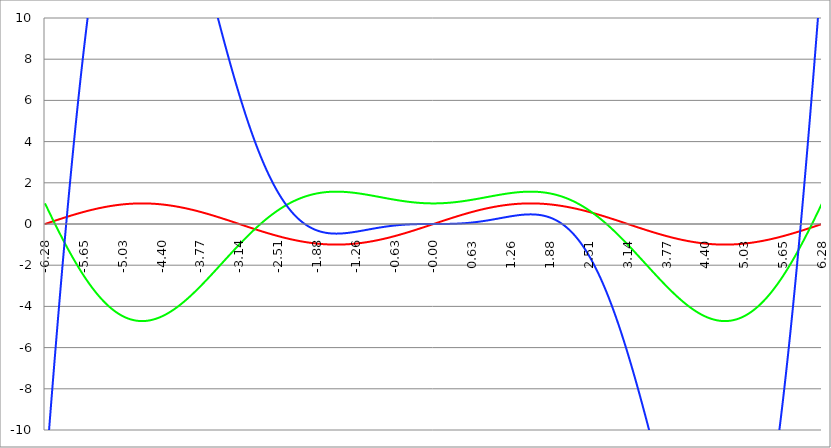
| Category | Series 1 | Series 0 | Series 2 |
|---|---|---|---|
| -6.283185307179586 | 0 | 1 | -12.566 |
| -6.276902121872407 | 0.006 | 0.961 | -12.319 |
| -6.270618936565228 | 0.013 | 0.921 | -12.071 |
| -6.264335751258049 | 0.019 | 0.882 | -11.824 |
| -6.25805256595087 | 0.025 | 0.842 | -11.578 |
| -6.25176938064369 | 0.031 | 0.803 | -11.333 |
| -6.245486195336511 | 0.038 | 0.764 | -11.087 |
| -6.23920301002933 | 0.044 | 0.725 | -10.843 |
| -6.232919824722153 | 0.05 | 0.686 | -10.599 |
| -6.226636639414973 | 0.057 | 0.646 | -10.355 |
| -6.220353454107794 | 0.063 | 0.607 | -10.112 |
| -6.214070268800615 | 0.069 | 0.568 | -9.87 |
| -6.207787083493435 | 0.075 | 0.53 | -9.628 |
| -6.201503898186257 | 0.082 | 0.491 | -9.387 |
| -6.195220712879077 | 0.088 | 0.452 | -9.146 |
| -6.188937527571898 | 0.094 | 0.413 | -8.907 |
| -6.182654342264719 | 0.1 | 0.374 | -8.667 |
| -6.17637115695754 | 0.107 | 0.336 | -8.429 |
| -6.170087971650361 | 0.113 | 0.297 | -8.191 |
| -6.163804786343182 | 0.119 | 0.259 | -7.953 |
| -6.157521601036002 | 0.125 | 0.22 | -7.717 |
| -6.151238415728823 | 0.132 | 0.182 | -7.481 |
| -6.144955230421644 | 0.138 | 0.144 | -7.245 |
| -6.138672045114464 | 0.144 | 0.106 | -7.011 |
| -6.132388859807286 | 0.15 | 0.067 | -6.777 |
| -6.126105674500106 | 0.156 | 0.029 | -6.543 |
| -6.119822489192927 | 0.163 | -0.009 | -6.311 |
| -6.113539303885748 | 0.169 | -0.047 | -6.079 |
| -6.107256118578569 | 0.175 | -0.084 | -5.848 |
| -6.10097293327139 | 0.181 | -0.122 | -5.618 |
| -6.09468974796421 | 0.187 | -0.16 | -5.388 |
| -6.088406562657031 | 0.194 | -0.197 | -5.159 |
| -6.082123377349852 | 0.2 | -0.235 | -4.931 |
| -6.075840192042672 | 0.206 | -0.272 | -4.704 |
| -6.069557006735494 | 0.212 | -0.31 | -4.477 |
| -6.063273821428314 | 0.218 | -0.347 | -4.251 |
| -6.056990636121135 | 0.224 | -0.384 | -4.026 |
| -6.050707450813956 | 0.23 | -0.421 | -3.802 |
| -6.044424265506777 | 0.236 | -0.458 | -3.578 |
| -6.038141080199597 | 0.243 | -0.495 | -3.356 |
| -6.031857894892418 | 0.249 | -0.531 | -3.134 |
| -6.025574709585239 | 0.255 | -0.568 | -2.913 |
| -6.01929152427806 | 0.261 | -0.605 | -2.693 |
| -6.013008338970881 | 0.267 | -0.641 | -2.473 |
| -6.006725153663701 | 0.273 | -0.678 | -2.255 |
| -6.000441968356522 | 0.279 | -0.714 | -2.037 |
| -5.994158783049343 | 0.285 | -0.75 | -1.82 |
| -5.987875597742164 | 0.291 | -0.786 | -1.604 |
| -5.981592412434984 | 0.297 | -0.822 | -1.389 |
| -5.975309227127805 | 0.303 | -0.858 | -1.175 |
| -5.969026041820626 | 0.309 | -0.893 | -0.962 |
| -5.962742856513447 | 0.315 | -0.929 | -0.749 |
| -5.956459671206268 | 0.321 | -0.965 | -0.538 |
| -5.950176485899088 | 0.327 | -1 | -0.327 |
| -5.94389330059191 | 0.333 | -1.035 | -0.117 |
| -5.93761011528473 | 0.339 | -1.07 | 0.092 |
| -5.931326929977551 | 0.345 | -1.105 | 0.3 |
| -5.925043744670372 | 0.351 | -1.14 | 0.507 |
| -5.918760559363193 | 0.356 | -1.175 | 0.713 |
| -5.912477374056014 | 0.362 | -1.21 | 0.918 |
| -5.906194188748834 | 0.368 | -1.244 | 1.122 |
| -5.899911003441655 | 0.374 | -1.279 | 1.326 |
| -5.893627818134476 | 0.38 | -1.313 | 1.528 |
| -5.887344632827297 | 0.386 | -1.347 | 1.729 |
| -5.881061447520117 | 0.391 | -1.381 | 1.93 |
| -5.874778262212938 | 0.397 | -1.415 | 2.129 |
| -5.868495076905759 | 0.403 | -1.449 | 2.328 |
| -5.86221189159858 | 0.409 | -1.483 | 2.525 |
| -5.855928706291401 | 0.414 | -1.516 | 2.722 |
| -5.849645520984221 | 0.42 | -1.55 | 2.918 |
| -5.843362335677042 | 0.426 | -1.583 | 3.112 |
| -5.837079150369863 | 0.431 | -1.616 | 3.306 |
| -5.830795965062684 | 0.437 | -1.649 | 3.498 |
| -5.824512779755505 | 0.443 | -1.682 | 3.69 |
| -5.818229594448325 | 0.448 | -1.715 | 3.881 |
| -5.811946409141146 | 0.454 | -1.748 | 4.07 |
| -5.805663223833967 | 0.46 | -1.78 | 4.259 |
| -5.799380038526788 | 0.465 | -1.812 | 4.446 |
| -5.793096853219609 | 0.471 | -1.845 | 4.633 |
| -5.78681366791243 | 0.476 | -1.877 | 4.819 |
| -5.780530482605251 | 0.482 | -1.908 | 5.003 |
| -5.774247297298071 | 0.487 | -1.94 | 5.186 |
| -5.767964111990892 | 0.493 | -1.972 | 5.369 |
| -5.761680926683713 | 0.498 | -2.003 | 5.55 |
| -5.755397741376534 | 0.504 | -2.035 | 5.731 |
| -5.749114556069355 | 0.509 | -2.066 | 5.91 |
| -5.742831370762175 | 0.514 | -2.097 | 6.088 |
| -5.736548185454996 | 0.52 | -2.128 | 6.265 |
| -5.730265000147816 | 0.525 | -2.158 | 6.441 |
| -5.723981814840638 | 0.531 | -2.189 | 6.616 |
| -5.717698629533459 | 0.536 | -2.219 | 6.79 |
| -5.711415444226279 | 0.541 | -2.25 | 6.963 |
| -5.7051322589191 | 0.546 | -2.28 | 7.135 |
| -5.698849073611921 | 0.552 | -2.31 | 7.306 |
| -5.692565888304742 | 0.557 | -2.339 | 7.476 |
| -5.686282702997562 | 0.562 | -2.369 | 7.644 |
| -5.679999517690383 | 0.567 | -2.399 | 7.812 |
| -5.673716332383204 | 0.572 | -2.428 | 7.978 |
| -5.667433147076025 | 0.578 | -2.457 | 8.143 |
| -5.661149961768846 | 0.583 | -2.486 | 8.307 |
| -5.654866776461667 | 0.588 | -2.515 | 8.471 |
| -5.648583591154487 | 0.593 | -2.543 | 8.633 |
| -5.642300405847308 | 0.598 | -2.572 | 8.793 |
| -5.63601722054013 | 0.603 | -2.6 | 8.953 |
| -5.62973403523295 | 0.608 | -2.628 | 9.112 |
| -5.623450849925771 | 0.613 | -2.656 | 9.269 |
| -5.617167664618591 | 0.618 | -2.684 | 9.426 |
| -5.610884479311412 | 0.623 | -2.712 | 9.581 |
| -5.604601294004233 | 0.628 | -2.739 | 9.735 |
| -5.598318108697054 | 0.633 | -2.767 | 9.889 |
| -5.592034923389875 | 0.637 | -2.794 | 10.04 |
| -5.585751738082695 | 0.642 | -2.821 | 10.191 |
| -5.579468552775516 | 0.647 | -2.848 | 10.341 |
| -5.573185367468337 | 0.652 | -2.874 | 10.49 |
| -5.566902182161157 | 0.657 | -2.901 | 10.637 |
| -5.560618996853979 | 0.661 | -2.927 | 10.783 |
| -5.5543358115468 | 0.666 | -2.953 | 10.928 |
| -5.54805262623962 | 0.671 | -2.979 | 11.072 |
| -5.54176944093244 | 0.675 | -3.005 | 11.215 |
| -5.535486255625262 | 0.68 | -3.031 | 11.357 |
| -5.529203070318083 | 0.685 | -3.056 | 11.498 |
| -5.522919885010904 | 0.689 | -3.081 | 11.637 |
| -5.516636699703724 | 0.694 | -3.106 | 11.775 |
| -5.510353514396545 | 0.698 | -3.131 | 11.913 |
| -5.504070329089366 | 0.703 | -3.156 | 12.049 |
| -5.497787143782186 | 0.707 | -3.18 | 12.184 |
| -5.491503958475008 | 0.712 | -3.205 | 12.317 |
| -5.485220773167828 | 0.716 | -3.229 | 12.45 |
| -5.47893758786065 | 0.72 | -3.253 | 12.581 |
| -5.47265440255347 | 0.725 | -3.277 | 12.711 |
| -5.466371217246291 | 0.729 | -3.3 | 12.841 |
| -5.460088031939112 | 0.733 | -3.324 | 12.968 |
| -5.453804846631932 | 0.738 | -3.347 | 13.095 |
| -5.447521661324753 | 0.742 | -3.37 | 13.221 |
| -5.441238476017574 | 0.746 | -3.393 | 13.345 |
| -5.434955290710395 | 0.75 | -3.416 | 13.469 |
| -5.428672105403215 | 0.754 | -3.438 | 13.591 |
| -5.422388920096036 | 0.758 | -3.46 | 13.712 |
| -5.416105734788857 | 0.762 | -3.482 | 13.832 |
| -5.409822549481678 | 0.766 | -3.504 | 13.95 |
| -5.403539364174499 | 0.771 | -3.526 | 14.068 |
| -5.39725617886732 | 0.775 | -3.548 | 14.184 |
| -5.39097299356014 | 0.778 | -3.569 | 14.299 |
| -5.384689808252961 | 0.782 | -3.59 | 14.414 |
| -5.378406622945782 | 0.786 | -3.611 | 14.526 |
| -5.372123437638603 | 0.79 | -3.632 | 14.638 |
| -5.365840252331424 | 0.794 | -3.652 | 14.749 |
| -5.359557067024244 | 0.798 | -3.673 | 14.858 |
| -5.353273881717065 | 0.802 | -3.693 | 14.966 |
| -5.346990696409886 | 0.805 | -3.713 | 15.073 |
| -5.340707511102707 | 0.809 | -3.733 | 15.179 |
| -5.334424325795528 | 0.813 | -3.753 | 15.284 |
| -5.328141140488348 | 0.816 | -3.772 | 15.388 |
| -5.32185795518117 | 0.82 | -3.791 | 15.49 |
| -5.31557476987399 | 0.824 | -3.81 | 15.591 |
| -5.30929158456681 | 0.827 | -3.829 | 15.692 |
| -5.303008399259631 | 0.831 | -3.848 | 15.791 |
| -5.296725213952453 | 0.834 | -3.866 | 15.888 |
| -5.290442028645273 | 0.838 | -3.884 | 15.985 |
| -5.284158843338094 | 0.841 | -3.903 | 16.081 |
| -5.277875658030915 | 0.844 | -3.92 | 16.175 |
| -5.271592472723735 | 0.848 | -3.938 | 16.268 |
| -5.265309287416557 | 0.851 | -3.956 | 16.36 |
| -5.259026102109377 | 0.854 | -3.973 | 16.451 |
| -5.252742916802198 | 0.858 | -3.99 | 16.541 |
| -5.246459731495019 | 0.861 | -4.007 | 16.629 |
| -5.24017654618784 | 0.864 | -4.023 | 16.717 |
| -5.23389336088066 | 0.867 | -4.04 | 16.803 |
| -5.227610175573481 | 0.87 | -4.056 | 16.888 |
| -5.221326990266302 | 0.873 | -4.072 | 16.972 |
| -5.215043804959122 | 0.876 | -4.088 | 17.055 |
| -5.208760619651944 | 0.879 | -4.104 | 17.137 |
| -5.202477434344764 | 0.882 | -4.119 | 17.218 |
| -5.196194249037585 | 0.885 | -4.135 | 17.297 |
| -5.189911063730406 | 0.888 | -4.15 | 17.375 |
| -5.183627878423227 | 0.891 | -4.165 | 17.453 |
| -5.177344693116048 | 0.894 | -4.179 | 17.529 |
| -5.171061507808868 | 0.897 | -4.194 | 17.604 |
| -5.164778322501689 | 0.899 | -4.208 | 17.678 |
| -5.15849513719451 | 0.902 | -4.222 | 17.75 |
| -5.152211951887331 | 0.905 | -4.236 | 17.822 |
| -5.145928766580152 | 0.907 | -4.25 | 17.892 |
| -5.139645581272972 | 0.91 | -4.263 | 17.962 |
| -5.133362395965793 | 0.913 | -4.277 | 18.03 |
| -5.127079210658614 | 0.915 | -4.29 | 18.097 |
| -5.120796025351435 | 0.918 | -4.302 | 18.163 |
| -5.114512840044256 | 0.92 | -4.315 | 18.228 |
| -5.108229654737076 | 0.923 | -4.328 | 18.292 |
| -5.101946469429897 | 0.925 | -4.34 | 18.354 |
| -5.095663284122718 | 0.927 | -4.352 | 18.416 |
| -5.08938009881554 | 0.93 | -4.364 | 18.476 |
| -5.08309691350836 | 0.932 | -4.376 | 18.536 |
| -5.07681372820118 | 0.934 | -4.387 | 18.594 |
| -5.070530542894002 | 0.937 | -4.398 | 18.651 |
| -5.064247357586822 | 0.939 | -4.409 | 18.707 |
| -5.057964172279643 | 0.941 | -4.42 | 18.762 |
| -5.051680986972464 | 0.943 | -4.431 | 18.816 |
| -5.045397801665285 | 0.945 | -4.441 | 18.869 |
| -5.039114616358106 | 0.947 | -4.452 | 18.921 |
| -5.032831431050926 | 0.949 | -4.462 | 18.971 |
| -5.026548245743747 | 0.951 | -4.472 | 19.021 |
| -5.020265060436568 | 0.953 | -4.481 | 19.069 |
| -5.013981875129389 | 0.955 | -4.491 | 19.117 |
| -5.00769868982221 | 0.957 | -4.5 | 19.163 |
| -5.00141550451503 | 0.959 | -4.509 | 19.209 |
| -4.995132319207851 | 0.96 | -4.518 | 19.253 |
| -4.98884913390067 | 0.962 | -4.526 | 19.296 |
| -4.982565948593493 | 0.964 | -4.535 | 19.338 |
| -4.976282763286313 | 0.965 | -4.543 | 19.379 |
| -4.969999577979134 | 0.967 | -4.551 | 19.419 |
| -4.963716392671955 | 0.969 | -4.559 | 19.458 |
| -4.957433207364776 | 0.97 | -4.567 | 19.496 |
| -4.951150022057597 | 0.972 | -4.574 | 19.533 |
| -4.944866836750418 | 0.973 | -4.581 | 19.569 |
| -4.938583651443238 | 0.975 | -4.589 | 19.604 |
| -4.932300466136059 | 0.976 | -4.595 | 19.638 |
| -4.92601728082888 | 0.977 | -4.602 | 19.671 |
| -4.9197340955217 | 0.979 | -4.608 | 19.703 |
| -4.913450910214521 | 0.98 | -4.615 | 19.733 |
| -4.907167724907342 | 0.981 | -4.621 | 19.763 |
| -4.900884539600163 | 0.982 | -4.627 | 19.792 |
| -4.894601354292984 | 0.983 | -4.632 | 19.82 |
| -4.888318168985805 | 0.985 | -4.638 | 19.847 |
| -4.882034983678625 | 0.986 | -4.643 | 19.872 |
| -4.875751798371446 | 0.987 | -4.648 | 19.897 |
| -4.869468613064267 | 0.988 | -4.653 | 19.921 |
| -4.863185427757088 | 0.989 | -4.658 | 19.944 |
| -4.856902242449909 | 0.99 | -4.662 | 19.966 |
| -4.85061905714273 | 0.99 | -4.667 | 19.986 |
| -4.84433587183555 | 0.991 | -4.671 | 20.006 |
| -4.838052686528371 | 0.992 | -4.675 | 20.025 |
| -4.831769501221192 | 0.993 | -4.678 | 20.043 |
| -4.825486315914013 | 0.994 | -4.682 | 20.06 |
| -4.819203130606833 | 0.994 | -4.685 | 20.076 |
| -4.812919945299654 | 0.995 | -4.688 | 20.091 |
| -4.806636759992475 | 0.996 | -4.691 | 20.105 |
| -4.800353574685296 | 0.996 | -4.694 | 20.119 |
| -4.794070389378117 | 0.997 | -4.696 | 20.131 |
| -4.787787204070938 | 0.997 | -4.699 | 20.142 |
| -4.781504018763758 | 0.998 | -4.701 | 20.153 |
| -4.77522083345658 | 0.998 | -4.703 | 20.162 |
| -4.7689376481494 | 0.998 | -4.705 | 20.171 |
| -4.762654462842221 | 0.999 | -4.706 | 20.178 |
| -4.756371277535042 | 0.999 | -4.708 | 20.185 |
| -4.750088092227862 | 0.999 | -4.709 | 20.191 |
| -4.743804906920683 | 1 | -4.71 | 20.196 |
| -4.737521721613504 | 1 | -4.711 | 20.2 |
| -4.731238536306324 | 1 | -4.712 | 20.203 |
| -4.724955350999146 | 1 | -4.712 | 20.205 |
| -4.718672165691966 | 1 | -4.712 | 20.206 |
| -4.712388980384787 | 1 | -4.712 | 20.207 |
| -4.706105795077608 | 1 | -4.712 | 20.206 |
| -4.699822609770429 | 1 | -4.712 | 20.205 |
| -4.69353942446325 | 1 | -4.712 | 20.203 |
| -4.68725623915607 | 1 | -4.711 | 20.2 |
| -4.680973053848891 | 1 | -4.71 | 20.196 |
| -4.674689868541712 | 0.999 | -4.709 | 20.191 |
| -4.668406683234533 | 0.999 | -4.708 | 20.185 |
| -4.662123497927354 | 0.999 | -4.706 | 20.179 |
| -4.655840312620174 | 0.998 | -4.705 | 20.172 |
| -4.649557127312995 | 0.998 | -4.703 | 20.164 |
| -4.643273942005816 | 0.998 | -4.701 | 20.155 |
| -4.636990756698637 | 0.997 | -4.699 | 20.145 |
| -4.630707571391458 | 0.997 | -4.697 | 20.134 |
| -4.624424386084279 | 0.996 | -4.694 | 20.123 |
| -4.618141200777099 | 0.996 | -4.692 | 20.111 |
| -4.61185801546992 | 0.995 | -4.689 | 20.098 |
| -4.605574830162741 | 0.994 | -4.686 | 20.084 |
| -4.599291644855561 | 0.994 | -4.683 | 20.069 |
| -4.593008459548383 | 0.993 | -4.679 | 20.054 |
| -4.586725274241203 | 0.992 | -4.676 | 20.038 |
| -4.580442088934024 | 0.991 | -4.672 | 20.021 |
| -4.574158903626845 | 0.99 | -4.668 | 20.003 |
| -4.567875718319666 | 0.99 | -4.664 | 19.984 |
| -4.561592533012487 | 0.989 | -4.66 | 19.965 |
| -4.555309347705307 | 0.988 | -4.656 | 19.945 |
| -4.549026162398128 | 0.987 | -4.651 | 19.924 |
| -4.542742977090949 | 0.986 | -4.646 | 19.903 |
| -4.53645979178377 | 0.985 | -4.641 | 19.881 |
| -4.530176606476591 | 0.983 | -4.636 | 19.858 |
| -4.523893421169412 | 0.982 | -4.631 | 19.834 |
| -4.517610235862232 | 0.981 | -4.626 | 19.809 |
| -4.511327050555053 | 0.98 | -4.62 | 19.784 |
| -4.505043865247874 | 0.979 | -4.614 | 19.758 |
| -4.498760679940694 | 0.977 | -4.609 | 19.732 |
| -4.492477494633515 | 0.976 | -4.602 | 19.704 |
| -4.486194309326336 | 0.975 | -4.596 | 19.676 |
| -4.479911124019157 | 0.973 | -4.59 | 19.648 |
| -4.473627938711977 | 0.972 | -4.583 | 19.618 |
| -4.467344753404799 | 0.97 | -4.576 | 19.588 |
| -4.46106156809762 | 0.969 | -4.57 | 19.558 |
| -4.45477838279044 | 0.967 | -4.563 | 19.526 |
| -4.44849519748326 | 0.965 | -4.555 | 19.494 |
| -4.442212012176082 | 0.964 | -4.548 | 19.461 |
| -4.435928826868903 | 0.962 | -4.54 | 19.428 |
| -4.429645641561723 | 0.96 | -4.533 | 19.394 |
| -4.423362456254544 | 0.959 | -4.525 | 19.359 |
| -4.417079270947365 | 0.957 | -4.517 | 19.324 |
| -4.410796085640185 | 0.955 | -4.509 | 19.288 |
| -4.404512900333007 | 0.953 | -4.5 | 19.251 |
| -4.398229715025827 | 0.951 | -4.492 | 19.214 |
| -4.391946529718648 | 0.949 | -4.483 | 19.176 |
| -4.38566334441147 | 0.947 | -4.475 | 19.137 |
| -4.37938015910429 | 0.945 | -4.466 | 19.098 |
| -4.373096973797111 | 0.943 | -4.457 | 19.059 |
| -4.366813788489932 | 0.941 | -4.447 | 19.018 |
| -4.360530603182752 | 0.939 | -4.438 | 18.977 |
| -4.354247417875573 | 0.937 | -4.429 | 18.936 |
| -4.347964232568394 | 0.934 | -4.419 | 18.894 |
| -4.341681047261215 | 0.932 | -4.409 | 18.851 |
| -4.335397861954035 | 0.93 | -4.399 | 18.808 |
| -4.329114676646856 | 0.927 | -4.389 | 18.764 |
| -4.322831491339677 | 0.925 | -4.379 | 18.72 |
| -4.316548306032498 | 0.923 | -4.368 | 18.675 |
| -4.310265120725319 | 0.92 | -4.358 | 18.63 |
| -4.30398193541814 | 0.918 | -4.347 | 18.584 |
| -4.29769875011096 | 0.915 | -4.336 | 18.537 |
| -4.291415564803781 | 0.913 | -4.325 | 18.49 |
| -4.285132379496602 | 0.91 | -4.314 | 18.443 |
| -4.278849194189422 | 0.907 | -4.303 | 18.395 |
| -4.272566008882244 | 0.905 | -4.292 | 18.346 |
| -4.266282823575064 | 0.902 | -4.28 | 18.297 |
| -4.259999638267885 | 0.899 | -4.269 | 18.247 |
| -4.253716452960706 | 0.897 | -4.257 | 18.197 |
| -4.247433267653527 | 0.894 | -4.245 | 18.147 |
| -4.241150082346347 | 0.891 | -4.233 | 18.096 |
| -4.234866897039168 | 0.888 | -4.221 | 18.044 |
| -4.228583711731989 | 0.885 | -4.208 | 17.992 |
| -4.22230052642481 | 0.882 | -4.196 | 17.94 |
| -4.216017341117631 | 0.879 | -4.183 | 17.887 |
| -4.209734155810452 | 0.876 | -4.171 | 17.833 |
| -4.203450970503273 | 0.873 | -4.158 | 17.779 |
| -4.197167785196093 | 0.87 | -4.145 | 17.725 |
| -4.190884599888914 | 0.867 | -4.132 | 17.67 |
| -4.184601414581734 | 0.864 | -4.119 | 17.615 |
| -4.178318229274556 | 0.861 | -4.105 | 17.56 |
| -4.172035043967377 | 0.858 | -4.092 | 17.503 |
| -4.165751858660197 | 0.854 | -4.079 | 17.447 |
| -4.159468673353018 | 0.851 | -4.065 | 17.39 |
| -4.153185488045839 | 0.848 | -4.051 | 17.333 |
| -4.14690230273866 | 0.844 | -4.037 | 17.275 |
| -4.140619117431481 | 0.841 | -4.023 | 17.217 |
| -4.134335932124301 | 0.838 | -4.009 | 17.159 |
| -4.128052746817122 | 0.834 | -3.995 | 17.1 |
| -4.121769561509943 | 0.831 | -3.98 | 17.04 |
| -4.115486376202764 | 0.827 | -3.966 | 16.981 |
| -4.109203190895584 | 0.824 | -3.951 | 16.921 |
| -4.102920005588405 | 0.82 | -3.937 | 16.86 |
| -4.096636820281226 | 0.816 | -3.922 | 16.8 |
| -4.090353634974047 | 0.813 | -3.907 | 16.739 |
| -4.084070449666868 | 0.809 | -3.892 | 16.677 |
| -4.077787264359689 | 0.805 | -3.877 | 16.615 |
| -4.071504079052509 | 0.802 | -3.861 | 16.553 |
| -4.06522089374533 | 0.798 | -3.846 | 16.491 |
| -4.058937708438151 | 0.794 | -3.831 | 16.428 |
| -4.052654523130972 | 0.79 | -3.815 | 16.365 |
| -4.046371337823793 | 0.786 | -3.799 | 16.302 |
| -4.040088152516613 | 0.782 | -3.784 | 16.238 |
| -4.033804967209434 | 0.778 | -3.768 | 16.174 |
| -4.027521781902255 | 0.775 | -3.752 | 16.11 |
| -4.021238596595076 | 0.771 | -3.736 | 16.045 |
| -4.014955411287897 | 0.766 | -3.72 | 15.98 |
| -4.008672225980717 | 0.762 | -3.703 | 15.915 |
| -4.002389040673538 | 0.758 | -3.687 | 15.849 |
| -3.996105855366359 | 0.754 | -3.671 | 15.784 |
| -3.989822670059179 | 0.75 | -3.654 | 15.718 |
| -3.983539484752 | 0.746 | -3.637 | 15.651 |
| -3.97725629944482 | 0.742 | -3.621 | 15.585 |
| -3.97097311413764 | 0.738 | -3.604 | 15.518 |
| -3.96468992883046 | 0.733 | -3.587 | 15.451 |
| -3.958406743523281 | 0.729 | -3.57 | 15.384 |
| -3.952123558216101 | 0.725 | -3.553 | 15.316 |
| -3.945840372908922 | 0.72 | -3.536 | 15.248 |
| -3.939557187601742 | 0.716 | -3.519 | 15.18 |
| -3.933274002294562 | 0.712 | -3.501 | 15.112 |
| -3.926990816987382 | 0.707 | -3.484 | 15.044 |
| -3.920707631680203 | 0.703 | -3.466 | 14.975 |
| -3.914424446373023 | 0.698 | -3.449 | 14.906 |
| -3.908141261065844 | 0.694 | -3.431 | 14.837 |
| -3.901858075758664 | 0.689 | -3.413 | 14.768 |
| -3.895574890451484 | 0.685 | -3.396 | 14.699 |
| -3.889291705144305 | 0.68 | -3.378 | 14.629 |
| -3.883008519837125 | 0.675 | -3.36 | 14.559 |
| -3.876725334529945 | 0.671 | -3.342 | 14.489 |
| -3.870442149222766 | 0.666 | -3.324 | 14.419 |
| -3.864158963915586 | 0.661 | -3.306 | 14.349 |
| -3.857875778608407 | 0.657 | -3.287 | 14.279 |
| -3.851592593301227 | 0.652 | -3.269 | 14.208 |
| -3.845309407994047 | 0.647 | -3.251 | 14.137 |
| -3.839026222686868 | 0.642 | -3.232 | 14.066 |
| -3.832743037379688 | 0.637 | -3.214 | 13.995 |
| -3.826459852072508 | 0.633 | -3.195 | 13.924 |
| -3.820176666765329 | 0.628 | -3.176 | 13.853 |
| -3.813893481458149 | 0.623 | -3.158 | 13.781 |
| -3.807610296150969 | 0.618 | -3.139 | 13.71 |
| -3.80132711084379 | 0.613 | -3.12 | 13.638 |
| -3.79504392553661 | 0.608 | -3.101 | 13.566 |
| -3.78876074022943 | 0.603 | -3.082 | 13.494 |
| -3.782477554922251 | 0.598 | -3.063 | 13.422 |
| -3.776194369615071 | 0.593 | -3.044 | 13.35 |
| -3.769911184307892 | 0.588 | -3.025 | 13.278 |
| -3.763627999000712 | 0.583 | -3.006 | 13.206 |
| -3.757344813693532 | 0.578 | -2.986 | 13.133 |
| -3.751061628386352 | 0.572 | -2.967 | 13.061 |
| -3.744778443079173 | 0.567 | -2.948 | 12.988 |
| -3.738495257771993 | 0.562 | -2.928 | 12.916 |
| -3.732212072464814 | 0.557 | -2.909 | 12.843 |
| -3.725928887157634 | 0.552 | -2.889 | 12.77 |
| -3.719645701850454 | 0.546 | -2.87 | 12.698 |
| -3.713362516543275 | 0.541 | -2.85 | 12.625 |
| -3.707079331236095 | 0.536 | -2.831 | 12.552 |
| -3.700796145928915 | 0.531 | -2.811 | 12.479 |
| -3.694512960621736 | 0.525 | -2.791 | 12.406 |
| -3.688229775314556 | 0.52 | -2.771 | 12.333 |
| -3.681946590007376 | 0.514 | -2.752 | 12.26 |
| -3.675663404700197 | 0.509 | -2.732 | 12.187 |
| -3.669380219393017 | 0.504 | -2.712 | 12.114 |
| -3.663097034085838 | 0.498 | -2.692 | 12.041 |
| -3.656813848778658 | 0.493 | -2.672 | 11.968 |
| -3.650530663471478 | 0.487 | -2.652 | 11.895 |
| -3.644247478164299 | 0.482 | -2.632 | 11.821 |
| -3.63796429285712 | 0.476 | -2.612 | 11.748 |
| -3.631681107549939 | 0.471 | -2.592 | 11.675 |
| -3.62539792224276 | 0.465 | -2.572 | 11.602 |
| -3.61911473693558 | 0.46 | -2.551 | 11.529 |
| -3.612831551628401 | 0.454 | -2.531 | 11.456 |
| -3.606548366321221 | 0.448 | -2.511 | 11.383 |
| -3.600265181014041 | 0.443 | -2.491 | 11.31 |
| -3.593981995706862 | 0.437 | -2.47 | 11.237 |
| -3.587698810399682 | 0.431 | -2.45 | 11.164 |
| -3.581415625092502 | 0.426 | -2.43 | 11.091 |
| -3.575132439785323 | 0.42 | -2.409 | 11.018 |
| -3.568849254478143 | 0.414 | -2.389 | 10.945 |
| -3.562566069170964 | 0.409 | -2.369 | 10.872 |
| -3.556282883863784 | 0.403 | -2.348 | 10.8 |
| -3.549999698556604 | 0.397 | -2.328 | 10.727 |
| -3.543716513249425 | 0.391 | -2.307 | 10.654 |
| -3.537433327942245 | 0.386 | -2.287 | 10.582 |
| -3.531150142635065 | 0.38 | -2.266 | 10.509 |
| -3.524866957327886 | 0.374 | -2.246 | 10.437 |
| -3.518583772020706 | 0.368 | -2.225 | 10.364 |
| -3.512300586713526 | 0.362 | -2.204 | 10.292 |
| -3.506017401406347 | 0.356 | -2.184 | 10.22 |
| -3.499734216099167 | 0.351 | -2.163 | 10.148 |
| -3.493451030791987 | 0.345 | -2.143 | 10.076 |
| -3.487167845484808 | 0.339 | -2.122 | 10.004 |
| -3.480884660177628 | 0.333 | -2.101 | 9.932 |
| -3.474601474870449 | 0.327 | -2.081 | 9.86 |
| -3.468318289563269 | 0.321 | -2.06 | 9.788 |
| -3.462035104256089 | 0.315 | -2.04 | 9.717 |
| -3.45575191894891 | 0.309 | -2.019 | 9.646 |
| -3.44946873364173 | 0.303 | -1.998 | 9.574 |
| -3.44318554833455 | 0.297 | -1.978 | 9.503 |
| -3.436902363027371 | 0.291 | -1.957 | 9.432 |
| -3.430619177720191 | 0.285 | -1.936 | 9.361 |
| -3.424335992413011 | 0.279 | -1.916 | 9.29 |
| -3.418052807105832 | 0.273 | -1.895 | 9.22 |
| -3.411769621798652 | 0.267 | -1.874 | 9.149 |
| -3.405486436491473 | 0.261 | -1.854 | 9.079 |
| -3.399203251184293 | 0.255 | -1.833 | 9.008 |
| -3.392920065877113 | 0.249 | -1.812 | 8.938 |
| -3.386636880569934 | 0.243 | -1.792 | 8.868 |
| -3.380353695262754 | 0.236 | -1.771 | 8.798 |
| -3.374070509955574 | 0.23 | -1.75 | 8.729 |
| -3.367787324648395 | 0.224 | -1.73 | 8.659 |
| -3.361504139341215 | 0.218 | -1.709 | 8.59 |
| -3.355220954034035 | 0.212 | -1.689 | 8.521 |
| -3.348937768726855 | 0.206 | -1.668 | 8.452 |
| -3.342654583419676 | 0.2 | -1.647 | 8.383 |
| -3.336371398112496 | 0.194 | -1.627 | 8.314 |
| -3.330088212805317 | 0.187 | -1.606 | 8.245 |
| -3.323805027498137 | 0.181 | -1.586 | 8.177 |
| -3.317521842190957 | 0.175 | -1.565 | 8.109 |
| -3.311238656883778 | 0.169 | -1.545 | 8.041 |
| -3.304955471576598 | 0.163 | -1.524 | 7.973 |
| -3.298672286269419 | 0.156 | -1.504 | 7.905 |
| -3.292389100962239 | 0.15 | -1.483 | 7.838 |
| -3.286105915655059 | 0.144 | -1.463 | 7.771 |
| -3.27982273034788 | 0.138 | -1.442 | 7.704 |
| -3.2735395450407 | 0.132 | -1.422 | 7.637 |
| -3.26725635973352 | 0.125 | -1.402 | 7.57 |
| -3.260973174426341 | 0.119 | -1.381 | 7.504 |
| -3.254689989119161 | 0.113 | -1.361 | 7.438 |
| -3.248406803811982 | 0.107 | -1.341 | 7.372 |
| -3.242123618504802 | 0.1 | -1.32 | 7.306 |
| -3.235840433197622 | 0.094 | -1.3 | 7.24 |
| -3.229557247890442 | 0.088 | -1.28 | 7.175 |
| -3.223274062583263 | 0.082 | -1.26 | 7.11 |
| -3.216990877276083 | 0.075 | -1.239 | 7.045 |
| -3.210707691968904 | 0.069 | -1.219 | 6.98 |
| -3.204424506661724 | 0.063 | -1.199 | 6.915 |
| -3.198141321354544 | 0.057 | -1.179 | 6.851 |
| -3.191858136047365 | 0.05 | -1.159 | 6.787 |
| -3.185574950740185 | 0.044 | -1.139 | 6.723 |
| -3.179291765433005 | 0.038 | -1.119 | 6.66 |
| -3.173008580125826 | 0.031 | -1.099 | 6.596 |
| -3.166725394818646 | 0.025 | -1.079 | 6.533 |
| -3.160442209511467 | 0.019 | -1.059 | 6.47 |
| -3.154159024204287 | 0.013 | -1.04 | 6.408 |
| -3.147875838897107 | 0.006 | -1.02 | 6.345 |
| -3.141592653589928 | 0 | -1 | 6.283 |
| -3.135309468282748 | -0.006 | -0.98 | 6.221 |
| -3.129026282975568 | -0.013 | -0.961 | 6.16 |
| -3.122743097668389 | -0.019 | -0.941 | 6.098 |
| -3.116459912361209 | -0.025 | -0.921 | 6.037 |
| -3.110176727054029 | -0.031 | -0.902 | 5.976 |
| -3.10389354174685 | -0.038 | -0.882 | 5.916 |
| -3.09761035643967 | -0.044 | -0.863 | 5.855 |
| -3.09132717113249 | -0.05 | -0.843 | 5.795 |
| -3.085043985825311 | -0.057 | -0.824 | 5.735 |
| -3.078760800518131 | -0.063 | -0.805 | 5.676 |
| -3.072477615210952 | -0.069 | -0.785 | 5.616 |
| -3.066194429903772 | -0.075 | -0.766 | 5.557 |
| -3.059911244596592 | -0.082 | -0.747 | 5.499 |
| -3.053628059289413 | -0.088 | -0.728 | 5.44 |
| -3.047344873982233 | -0.094 | -0.709 | 5.382 |
| -3.041061688675053 | -0.1 | -0.69 | 5.324 |
| -3.034778503367874 | -0.107 | -0.671 | 5.266 |
| -3.028495318060694 | -0.113 | -0.652 | 5.209 |
| -3.022212132753515 | -0.119 | -0.633 | 5.152 |
| -3.015928947446335 | -0.125 | -0.614 | 5.095 |
| -3.009645762139155 | -0.132 | -0.595 | 5.038 |
| -3.003362576831975 | -0.138 | -0.577 | 4.982 |
| -2.997079391524796 | -0.144 | -0.558 | 4.926 |
| -2.990796206217616 | -0.15 | -0.539 | 4.87 |
| -2.984513020910436 | -0.156 | -0.521 | 4.815 |
| -2.978229835603257 | -0.163 | -0.502 | 4.76 |
| -2.971946650296077 | -0.169 | -0.484 | 4.705 |
| -2.965663464988898 | -0.175 | -0.466 | 4.65 |
| -2.959380279681718 | -0.181 | -0.447 | 4.596 |
| -2.953097094374538 | -0.187 | -0.429 | 4.542 |
| -2.946813909067359 | -0.194 | -0.411 | 4.489 |
| -2.94053072376018 | -0.2 | -0.393 | 4.435 |
| -2.934247538453 | -0.206 | -0.375 | 4.382 |
| -2.92796435314582 | -0.212 | -0.357 | 4.329 |
| -2.92168116783864 | -0.218 | -0.339 | 4.277 |
| -2.915397982531461 | -0.224 | -0.321 | 4.225 |
| -2.909114797224281 | -0.23 | -0.303 | 4.173 |
| -2.902831611917101 | -0.236 | -0.285 | 4.121 |
| -2.896548426609922 | -0.243 | -0.267 | 4.07 |
| -2.890265241302742 | -0.249 | -0.25 | 4.019 |
| -2.883982055995562 | -0.255 | -0.232 | 3.968 |
| -2.877698870688383 | -0.261 | -0.215 | 3.918 |
| -2.871415685381203 | -0.267 | -0.197 | 3.868 |
| -2.865132500074023 | -0.273 | -0.18 | 3.818 |
| -2.858849314766844 | -0.279 | -0.163 | 3.768 |
| -2.852566129459664 | -0.285 | -0.145 | 3.719 |
| -2.846282944152485 | -0.291 | -0.128 | 3.67 |
| -2.839999758845305 | -0.297 | -0.111 | 3.622 |
| -2.833716573538125 | -0.303 | -0.094 | 3.574 |
| -2.827433388230946 | -0.309 | -0.077 | 3.526 |
| -2.821150202923766 | -0.315 | -0.06 | 3.478 |
| -2.814867017616586 | -0.321 | -0.044 | 3.431 |
| -2.808583832309407 | -0.327 | -0.027 | 3.384 |
| -2.802300647002227 | -0.333 | -0.01 | 3.337 |
| -2.796017461695047 | -0.339 | 0.006 | 3.291 |
| -2.789734276387867 | -0.345 | 0.023 | 3.245 |
| -2.783451091080688 | -0.351 | 0.039 | 3.199 |
| -2.777167905773509 | -0.356 | 0.055 | 3.154 |
| -2.770884720466329 | -0.362 | 0.072 | 3.108 |
| -2.764601535159149 | -0.368 | 0.088 | 3.064 |
| -2.75831834985197 | -0.374 | 0.104 | 3.019 |
| -2.75203516454479 | -0.38 | 0.12 | 2.975 |
| -2.74575197923761 | -0.386 | 0.136 | 2.931 |
| -2.739468793930431 | -0.391 | 0.152 | 2.888 |
| -2.733185608623251 | -0.397 | 0.168 | 2.844 |
| -2.726902423316071 | -0.403 | 0.183 | 2.801 |
| -2.720619238008892 | -0.409 | 0.199 | 2.759 |
| -2.714336052701712 | -0.414 | 0.215 | 2.716 |
| -2.708052867394532 | -0.42 | 0.23 | 2.674 |
| -2.701769682087352 | -0.426 | 0.246 | 2.633 |
| -2.695486496780173 | -0.431 | 0.261 | 2.591 |
| -2.689203311472993 | -0.437 | 0.276 | 2.55 |
| -2.682920126165814 | -0.443 | 0.291 | 2.51 |
| -2.676636940858634 | -0.448 | 0.306 | 2.469 |
| -2.670353755551454 | -0.454 | 0.321 | 2.429 |
| -2.664070570244275 | -0.46 | 0.336 | 2.39 |
| -2.657787384937095 | -0.465 | 0.351 | 2.35 |
| -2.651504199629916 | -0.471 | 0.366 | 2.311 |
| -2.645221014322736 | -0.476 | 0.38 | 2.272 |
| -2.638937829015556 | -0.482 | 0.395 | 2.234 |
| -2.632654643708377 | -0.487 | 0.409 | 2.195 |
| -2.626371458401197 | -0.493 | 0.424 | 2.158 |
| -2.620088273094018 | -0.498 | 0.438 | 2.12 |
| -2.613805087786838 | -0.504 | 0.452 | 2.083 |
| -2.607521902479658 | -0.509 | 0.467 | 2.046 |
| -2.601238717172478 | -0.514 | 0.481 | 2.009 |
| -2.594955531865299 | -0.52 | 0.495 | 1.973 |
| -2.588672346558119 | -0.525 | 0.509 | 1.937 |
| -2.58238916125094 | -0.531 | 0.522 | 1.901 |
| -2.57610597594376 | -0.536 | 0.536 | 1.866 |
| -2.56982279063658 | -0.541 | 0.55 | 1.831 |
| -2.563539605329401 | -0.546 | 0.563 | 1.796 |
| -2.557256420022221 | -0.552 | 0.577 | 1.762 |
| -2.550973234715042 | -0.557 | 0.59 | 1.728 |
| -2.544690049407862 | -0.562 | 0.603 | 1.694 |
| -2.538406864100682 | -0.567 | 0.616 | 1.66 |
| -2.532123678793503 | -0.572 | 0.63 | 1.627 |
| -2.525840493486323 | -0.578 | 0.643 | 1.594 |
| -2.519557308179143 | -0.583 | 0.655 | 1.562 |
| -2.513274122871964 | -0.588 | 0.668 | 1.529 |
| -2.506990937564784 | -0.593 | 0.681 | 1.497 |
| -2.500707752257604 | -0.598 | 0.694 | 1.466 |
| -2.494424566950425 | -0.603 | 0.706 | 1.434 |
| -2.488141381643245 | -0.608 | 0.719 | 1.403 |
| -2.481858196336065 | -0.613 | 0.731 | 1.373 |
| -2.475575011028886 | -0.618 | 0.743 | 1.342 |
| -2.469291825721706 | -0.623 | 0.755 | 1.312 |
| -2.463008640414527 | -0.628 | 0.768 | 1.282 |
| -2.456725455107347 | -0.633 | 0.78 | 1.253 |
| -2.450442269800167 | -0.637 | 0.791 | 1.224 |
| -2.444159084492988 | -0.642 | 0.803 | 1.195 |
| -2.437875899185808 | -0.647 | 0.815 | 1.166 |
| -2.431592713878628 | -0.652 | 0.827 | 1.138 |
| -2.425309528571449 | -0.657 | 0.838 | 1.11 |
| -2.419026343264269 | -0.661 | 0.85 | 1.082 |
| -2.412743157957089 | -0.666 | 0.861 | 1.054 |
| -2.40645997264991 | -0.671 | 0.872 | 1.027 |
| -2.40017678734273 | -0.675 | 0.883 | 1 |
| -2.393893602035551 | -0.68 | 0.894 | 0.974 |
| -2.387610416728371 | -0.685 | 0.905 | 0.948 |
| -2.381327231421191 | -0.689 | 0.916 | 0.922 |
| -2.375044046114012 | -0.694 | 0.927 | 0.896 |
| -2.368760860806832 | -0.698 | 0.938 | 0.871 |
| -2.362477675499652 | -0.703 | 0.948 | 0.846 |
| -2.356194490192473 | -0.707 | 0.959 | 0.821 |
| -2.349911304885293 | -0.712 | 0.969 | 0.796 |
| -2.343628119578113 | -0.716 | 0.98 | 0.772 |
| -2.337344934270934 | -0.72 | 0.99 | 0.748 |
| -2.331061748963754 | -0.725 | 1 | 0.724 |
| -2.324778563656574 | -0.729 | 1.01 | 0.701 |
| -2.318495378349395 | -0.733 | 1.02 | 0.678 |
| -2.312212193042215 | -0.738 | 1.03 | 0.655 |
| -2.305929007735036 | -0.742 | 1.04 | 0.633 |
| -2.299645822427856 | -0.746 | 1.049 | 0.61 |
| -2.293362637120676 | -0.75 | 1.059 | 0.588 |
| -2.287079451813496 | -0.754 | 1.068 | 0.567 |
| -2.280796266506317 | -0.758 | 1.078 | 0.545 |
| -2.274513081199137 | -0.762 | 1.087 | 0.524 |
| -2.268229895891957 | -0.766 | 1.096 | 0.503 |
| -2.261946710584778 | -0.771 | 1.105 | 0.482 |
| -2.255663525277598 | -0.775 | 1.114 | 0.462 |
| -2.249380339970419 | -0.778 | 1.123 | 0.442 |
| -2.24309715466324 | -0.782 | 1.132 | 0.422 |
| -2.23681396935606 | -0.786 | 1.141 | 0.403 |
| -2.23053078404888 | -0.79 | 1.15 | 0.383 |
| -2.2242475987417 | -0.794 | 1.158 | 0.364 |
| -2.217964413434521 | -0.798 | 1.167 | 0.345 |
| -2.211681228127341 | -0.802 | 1.175 | 0.327 |
| -2.205398042820161 | -0.805 | 1.183 | 0.309 |
| -2.199114857512981 | -0.809 | 1.191 | 0.291 |
| -2.192831672205802 | -0.813 | 1.199 | 0.273 |
| -2.186548486898622 | -0.816 | 1.207 | 0.256 |
| -2.180265301591443 | -0.82 | 1.215 | 0.238 |
| -2.173982116284263 | -0.824 | 1.223 | 0.221 |
| -2.167698930977084 | -0.827 | 1.231 | 0.205 |
| -2.161415745669904 | -0.831 | 1.238 | 0.188 |
| -2.155132560362724 | -0.834 | 1.246 | 0.172 |
| -2.148849375055545 | -0.838 | 1.253 | 0.156 |
| -2.142566189748365 | -0.841 | 1.261 | 0.14 |
| -2.136283004441185 | -0.844 | 1.268 | 0.125 |
| -2.129999819134006 | -0.848 | 1.275 | 0.11 |
| -2.123716633826826 | -0.851 | 1.282 | 0.095 |
| -2.117433448519646 | -0.854 | 1.289 | 0.08 |
| -2.111150263212467 | -0.858 | 1.296 | 0.065 |
| -2.104867077905287 | -0.861 | 1.303 | 0.051 |
| -2.098583892598107 | -0.864 | 1.309 | 0.037 |
| -2.092300707290928 | -0.867 | 1.316 | 0.023 |
| -2.086017521983748 | -0.87 | 1.322 | 0.009 |
| -2.079734336676569 | -0.873 | 1.329 | -0.004 |
| -2.073451151369389 | -0.876 | 1.335 | -0.017 |
| -2.06716796606221 | -0.879 | 1.341 | -0.03 |
| -2.06088478075503 | -0.882 | 1.348 | -0.043 |
| -2.05460159544785 | -0.885 | 1.354 | -0.055 |
| -2.04831841014067 | -0.888 | 1.36 | -0.067 |
| -2.042035224833491 | -0.891 | 1.365 | -0.079 |
| -2.035752039526311 | -0.894 | 1.371 | -0.091 |
| -2.029468854219131 | -0.897 | 1.377 | -0.103 |
| -2.023185668911951 | -0.899 | 1.383 | -0.114 |
| -2.016902483604772 | -0.902 | 1.388 | -0.125 |
| -2.010619298297592 | -0.905 | 1.393 | -0.136 |
| -2.004336112990412 | -0.907 | 1.399 | -0.147 |
| -1.998052927683233 | -0.91 | 1.404 | -0.157 |
| -1.991769742376054 | -0.913 | 1.409 | -0.168 |
| -1.985486557068874 | -0.915 | 1.414 | -0.178 |
| -1.979203371761694 | -0.918 | 1.419 | -0.187 |
| -1.972920186454515 | -0.92 | 1.424 | -0.197 |
| -1.966637001147335 | -0.923 | 1.429 | -0.207 |
| -1.960353815840155 | -0.925 | 1.434 | -0.216 |
| -1.954070630532976 | -0.927 | 1.438 | -0.225 |
| -1.947787445225796 | -0.93 | 1.443 | -0.234 |
| -1.941504259918616 | -0.932 | 1.447 | -0.243 |
| -1.935221074611437 | -0.934 | 1.452 | -0.251 |
| -1.928937889304257 | -0.937 | 1.456 | -0.259 |
| -1.922654703997078 | -0.939 | 1.46 | -0.267 |
| -1.916371518689898 | -0.941 | 1.464 | -0.275 |
| -1.910088333382718 | -0.943 | 1.468 | -0.283 |
| -1.903805148075539 | -0.945 | 1.472 | -0.291 |
| -1.897521962768359 | -0.947 | 1.476 | -0.298 |
| -1.891238777461179 | -0.949 | 1.48 | -0.305 |
| -1.884955592154 | -0.951 | 1.484 | -0.312 |
| -1.87867240684682 | -0.953 | 1.487 | -0.319 |
| -1.87238922153964 | -0.955 | 1.491 | -0.326 |
| -1.866106036232461 | -0.957 | 1.494 | -0.332 |
| -1.859822850925281 | -0.959 | 1.498 | -0.338 |
| -1.853539665618102 | -0.96 | 1.501 | -0.344 |
| -1.847256480310922 | -0.962 | 1.504 | -0.35 |
| -1.840973295003742 | -0.964 | 1.507 | -0.356 |
| -1.834690109696563 | -0.965 | 1.51 | -0.362 |
| -1.828406924389383 | -0.967 | 1.513 | -0.367 |
| -1.822123739082203 | -0.969 | 1.516 | -0.372 |
| -1.815840553775024 | -0.97 | 1.519 | -0.377 |
| -1.809557368467844 | -0.972 | 1.522 | -0.382 |
| -1.803274183160664 | -0.973 | 1.524 | -0.387 |
| -1.796990997853485 | -0.975 | 1.527 | -0.392 |
| -1.790707812546305 | -0.976 | 1.529 | -0.396 |
| -1.784424627239125 | -0.977 | 1.532 | -0.401 |
| -1.778141441931946 | -0.979 | 1.534 | -0.405 |
| -1.771858256624766 | -0.98 | 1.536 | -0.409 |
| -1.765575071317587 | -0.981 | 1.539 | -0.413 |
| -1.759291886010407 | -0.982 | 1.541 | -0.416 |
| -1.753008700703227 | -0.983 | 1.543 | -0.42 |
| -1.746725515396048 | -0.985 | 1.545 | -0.423 |
| -1.740442330088868 | -0.986 | 1.547 | -0.427 |
| -1.734159144781688 | -0.987 | 1.548 | -0.43 |
| -1.727875959474509 | -0.988 | 1.55 | -0.433 |
| -1.72159277416733 | -0.989 | 1.552 | -0.436 |
| -1.715309588860149 | -0.99 | 1.553 | -0.438 |
| -1.70902640355297 | -0.99 | 1.555 | -0.441 |
| -1.70274321824579 | -0.991 | 1.556 | -0.443 |
| -1.69646003293861 | -0.992 | 1.558 | -0.446 |
| -1.690176847631431 | -0.993 | 1.559 | -0.448 |
| -1.683893662324251 | -0.994 | 1.56 | -0.45 |
| -1.677610477017072 | -0.994 | 1.561 | -0.452 |
| -1.671327291709892 | -0.995 | 1.563 | -0.454 |
| -1.665044106402712 | -0.996 | 1.564 | -0.456 |
| -1.658760921095533 | -0.996 | 1.564 | -0.457 |
| -1.652477735788353 | -0.997 | 1.565 | -0.459 |
| -1.646194550481173 | -0.997 | 1.566 | -0.46 |
| -1.639911365173994 | -0.998 | 1.567 | -0.461 |
| -1.633628179866814 | -0.998 | 1.568 | -0.462 |
| -1.627344994559634 | -0.998 | 1.568 | -0.463 |
| -1.621061809252455 | -0.999 | 1.569 | -0.464 |
| -1.614778623945275 | -0.999 | 1.569 | -0.465 |
| -1.608495438638096 | -0.999 | 1.57 | -0.466 |
| -1.602212253330916 | -1 | 1.57 | -0.466 |
| -1.595929068023736 | -1 | 1.57 | -0.467 |
| -1.589645882716557 | -1 | 1.571 | -0.467 |
| -1.583362697409377 | -1 | 1.571 | -0.467 |
| -1.577079512102197 | -1 | 1.571 | -0.467 |
| -1.570796326795018 | -1 | 1.571 | -0.467 |
| -1.564513141487838 | -1 | 1.571 | -0.467 |
| -1.558229956180659 | -1 | 1.571 | -0.467 |
| -1.551946770873479 | -1 | 1.571 | -0.467 |
| -1.545663585566299 | -1 | 1.57 | -0.467 |
| -1.53938040025912 | -1 | 1.57 | -0.466 |
| -1.53309721495194 | -0.999 | 1.57 | -0.466 |
| -1.52681402964476 | -0.999 | 1.569 | -0.465 |
| -1.520530844337581 | -0.999 | 1.569 | -0.464 |
| -1.514247659030401 | -0.998 | 1.568 | -0.464 |
| -1.507964473723221 | -0.998 | 1.568 | -0.463 |
| -1.501681288416042 | -0.998 | 1.567 | -0.462 |
| -1.495398103108862 | -0.997 | 1.566 | -0.461 |
| -1.489114917801682 | -0.997 | 1.566 | -0.46 |
| -1.482831732494503 | -0.996 | 1.565 | -0.459 |
| -1.476548547187323 | -0.996 | 1.564 | -0.457 |
| -1.470265361880144 | -0.995 | 1.563 | -0.456 |
| -1.463982176572964 | -0.994 | 1.562 | -0.455 |
| -1.457698991265784 | -0.994 | 1.561 | -0.453 |
| -1.451415805958605 | -0.993 | 1.56 | -0.452 |
| -1.445132620651425 | -0.992 | 1.559 | -0.45 |
| -1.438849435344245 | -0.991 | 1.558 | -0.448 |
| -1.432566250037066 | -0.99 | 1.557 | -0.447 |
| -1.426283064729886 | -0.99 | 1.555 | -0.445 |
| -1.419999879422706 | -0.989 | 1.554 | -0.443 |
| -1.413716694115527 | -0.988 | 1.553 | -0.441 |
| -1.407433508808347 | -0.987 | 1.551 | -0.439 |
| -1.401150323501168 | -0.986 | 1.55 | -0.437 |
| -1.394867138193988 | -0.985 | 1.548 | -0.435 |
| -1.388583952886808 | -0.983 | 1.547 | -0.433 |
| -1.382300767579629 | -0.982 | 1.545 | -0.43 |
| -1.376017582272449 | -0.981 | 1.544 | -0.428 |
| -1.369734396965269 | -0.98 | 1.542 | -0.426 |
| -1.36345121165809 | -0.979 | 1.54 | -0.423 |
| -1.35716802635091 | -0.977 | 1.538 | -0.421 |
| -1.35088484104373 | -0.976 | 1.536 | -0.418 |
| -1.344601655736551 | -0.975 | 1.535 | -0.416 |
| -1.338318470429371 | -0.973 | 1.533 | -0.413 |
| -1.332035285122191 | -0.972 | 1.531 | -0.411 |
| -1.325752099815012 | -0.97 | 1.529 | -0.408 |
| -1.319468914507832 | -0.969 | 1.527 | -0.405 |
| -1.313185729200653 | -0.967 | 1.525 | -0.403 |
| -1.306902543893473 | -0.965 | 1.523 | -0.4 |
| -1.300619358586293 | -0.964 | 1.52 | -0.397 |
| -1.294336173279114 | -0.962 | 1.518 | -0.394 |
| -1.288052987971934 | -0.96 | 1.516 | -0.391 |
| -1.281769802664754 | -0.959 | 1.514 | -0.388 |
| -1.275486617357575 | -0.957 | 1.511 | -0.385 |
| -1.269203432050395 | -0.955 | 1.509 | -0.382 |
| -1.262920246743215 | -0.953 | 1.507 | -0.379 |
| -1.256637061436036 | -0.951 | 1.504 | -0.376 |
| -1.250353876128856 | -0.949 | 1.502 | -0.373 |
| -1.244070690821677 | -0.947 | 1.499 | -0.37 |
| -1.237787505514497 | -0.945 | 1.497 | -0.367 |
| -1.231504320207317 | -0.943 | 1.494 | -0.364 |
| -1.225221134900138 | -0.941 | 1.492 | -0.361 |
| -1.218937949592958 | -0.939 | 1.489 | -0.358 |
| -1.212654764285778 | -0.937 | 1.486 | -0.354 |
| -1.206371578978599 | -0.934 | 1.484 | -0.351 |
| -1.20008839367142 | -0.932 | 1.481 | -0.348 |
| -1.193805208364239 | -0.93 | 1.478 | -0.344 |
| -1.18752202305706 | -0.927 | 1.475 | -0.341 |
| -1.18123883774988 | -0.925 | 1.473 | -0.338 |
| -1.1749556524427 | -0.923 | 1.47 | -0.335 |
| -1.168672467135521 | -0.92 | 1.467 | -0.331 |
| -1.162389281828341 | -0.918 | 1.464 | -0.328 |
| -1.156106096521162 | -0.915 | 1.461 | -0.324 |
| -1.149822911213982 | -0.913 | 1.458 | -0.321 |
| -1.143539725906802 | -0.91 | 1.455 | -0.318 |
| -1.137256540599623 | -0.907 | 1.452 | -0.314 |
| -1.130973355292443 | -0.905 | 1.449 | -0.311 |
| -1.124690169985263 | -0.902 | 1.446 | -0.307 |
| -1.118406984678084 | -0.899 | 1.443 | -0.304 |
| -1.112123799370904 | -0.897 | 1.44 | -0.301 |
| -1.105840614063724 | -0.894 | 1.437 | -0.297 |
| -1.099557428756545 | -0.891 | 1.434 | -0.294 |
| -1.093274243449365 | -0.888 | 1.431 | -0.29 |
| -1.086991058142186 | -0.885 | 1.427 | -0.287 |
| -1.080707872835006 | -0.882 | 1.424 | -0.283 |
| -1.074424687527826 | -0.879 | 1.421 | -0.28 |
| -1.068141502220647 | -0.876 | 1.418 | -0.276 |
| -1.061858316913467 | -0.873 | 1.415 | -0.273 |
| -1.055575131606287 | -0.87 | 1.411 | -0.269 |
| -1.049291946299108 | -0.867 | 1.408 | -0.266 |
| -1.043008760991928 | -0.864 | 1.405 | -0.263 |
| -1.036725575684748 | -0.861 | 1.401 | -0.259 |
| -1.030442390377569 | -0.858 | 1.398 | -0.256 |
| -1.024159205070389 | -0.854 | 1.395 | -0.252 |
| -1.01787601976321 | -0.851 | 1.391 | -0.249 |
| -1.01159283445603 | -0.848 | 1.388 | -0.245 |
| -1.00530964914885 | -0.844 | 1.385 | -0.242 |
| -0.999026463841671 | -0.841 | 1.381 | -0.239 |
| -0.992743278534491 | -0.838 | 1.378 | -0.235 |
| -0.986460093227311 | -0.834 | 1.374 | -0.232 |
| -0.980176907920132 | -0.831 | 1.371 | -0.228 |
| -0.973893722612952 | -0.827 | 1.368 | -0.225 |
| -0.967610537305772 | -0.824 | 1.364 | -0.222 |
| -0.961327351998593 | -0.82 | 1.361 | -0.218 |
| -0.955044166691413 | -0.816 | 1.357 | -0.215 |
| -0.948760981384233 | -0.813 | 1.354 | -0.212 |
| -0.942477796077054 | -0.809 | 1.35 | -0.209 |
| -0.936194610769874 | -0.805 | 1.347 | -0.205 |
| -0.929911425462695 | -0.802 | 1.343 | -0.202 |
| -0.923628240155515 | -0.798 | 1.34 | -0.199 |
| -0.917345054848335 | -0.794 | 1.336 | -0.196 |
| -0.911061869541156 | -0.79 | 1.333 | -0.192 |
| -0.904778684233976 | -0.786 | 1.329 | -0.189 |
| -0.898495498926796 | -0.782 | 1.326 | -0.186 |
| -0.892212313619617 | -0.778 | 1.322 | -0.183 |
| -0.885929128312437 | -0.775 | 1.319 | -0.18 |
| -0.879645943005257 | -0.771 | 1.315 | -0.177 |
| -0.873362757698078 | -0.766 | 1.312 | -0.174 |
| -0.867079572390898 | -0.762 | 1.308 | -0.17 |
| -0.860796387083718 | -0.758 | 1.305 | -0.167 |
| -0.854513201776539 | -0.754 | 1.301 | -0.164 |
| -0.848230016469359 | -0.75 | 1.298 | -0.161 |
| -0.84194683116218 | -0.746 | 1.294 | -0.158 |
| -0.835663645855 | -0.742 | 1.291 | -0.155 |
| -0.82938046054782 | -0.738 | 1.287 | -0.153 |
| -0.823097275240641 | -0.733 | 1.283 | -0.15 |
| -0.816814089933461 | -0.729 | 1.28 | -0.147 |
| -0.810530904626281 | -0.725 | 1.276 | -0.144 |
| -0.804247719319102 | -0.72 | 1.273 | -0.141 |
| -0.797964534011922 | -0.716 | 1.269 | -0.138 |
| -0.791681348704742 | -0.712 | 1.266 | -0.135 |
| -0.785398163397563 | -0.707 | 1.262 | -0.133 |
| -0.779114978090383 | -0.703 | 1.259 | -0.13 |
| -0.772831792783204 | -0.698 | 1.256 | -0.127 |
| -0.766548607476024 | -0.694 | 1.252 | -0.125 |
| -0.760265422168844 | -0.689 | 1.249 | -0.122 |
| -0.753982236861665 | -0.685 | 1.245 | -0.119 |
| -0.747699051554485 | -0.68 | 1.242 | -0.117 |
| -0.741415866247305 | -0.675 | 1.238 | -0.114 |
| -0.735132680940126 | -0.671 | 1.235 | -0.112 |
| -0.728849495632946 | -0.666 | 1.231 | -0.109 |
| -0.722566310325766 | -0.661 | 1.228 | -0.107 |
| -0.716283125018587 | -0.657 | 1.225 | -0.104 |
| -0.709999939711407 | -0.652 | 1.221 | -0.102 |
| -0.703716754404227 | -0.647 | 1.218 | -0.099 |
| -0.697433569097048 | -0.642 | 1.214 | -0.097 |
| -0.691150383789868 | -0.637 | 1.211 | -0.095 |
| -0.684867198482689 | -0.633 | 1.208 | -0.092 |
| -0.678584013175509 | -0.628 | 1.204 | -0.09 |
| -0.672300827868329 | -0.623 | 1.201 | -0.088 |
| -0.66601764256115 | -0.618 | 1.198 | -0.086 |
| -0.65973445725397 | -0.613 | 1.195 | -0.084 |
| -0.65345127194679 | -0.608 | 1.191 | -0.081 |
| -0.647168086639611 | -0.603 | 1.188 | -0.079 |
| -0.640884901332431 | -0.598 | 1.185 | -0.077 |
| -0.634601716025251 | -0.593 | 1.182 | -0.075 |
| -0.628318530718072 | -0.588 | 1.178 | -0.073 |
| -0.622035345410892 | -0.583 | 1.175 | -0.071 |
| -0.615752160103712 | -0.578 | 1.172 | -0.069 |
| -0.609468974796533 | -0.572 | 1.169 | -0.067 |
| -0.603185789489353 | -0.567 | 1.166 | -0.065 |
| -0.596902604182174 | -0.562 | 1.163 | -0.063 |
| -0.590619418874994 | -0.557 | 1.159 | -0.062 |
| -0.584336233567814 | -0.552 | 1.156 | -0.06 |
| -0.578053048260635 | -0.546 | 1.153 | -0.058 |
| -0.571769862953455 | -0.541 | 1.15 | -0.056 |
| -0.565486677646275 | -0.536 | 1.147 | -0.055 |
| -0.559203492339096 | -0.531 | 1.144 | -0.053 |
| -0.552920307031916 | -0.525 | 1.141 | -0.051 |
| -0.546637121724737 | -0.52 | 1.138 | -0.05 |
| -0.540353936417557 | -0.514 | 1.136 | -0.048 |
| -0.534070751110377 | -0.509 | 1.133 | -0.047 |
| -0.527787565803198 | -0.504 | 1.13 | -0.045 |
| -0.521504380496018 | -0.498 | 1.127 | -0.043 |
| -0.515221195188838 | -0.493 | 1.124 | -0.042 |
| -0.508938009881659 | -0.487 | 1.121 | -0.041 |
| -0.502654824574479 | -0.482 | 1.118 | -0.039 |
| -0.496371639267299 | -0.476 | 1.116 | -0.038 |
| -0.49008845396012 | -0.471 | 1.113 | -0.036 |
| -0.48380526865294 | -0.465 | 1.11 | -0.035 |
| -0.477522083345761 | -0.46 | 1.108 | -0.034 |
| -0.471238898038581 | -0.454 | 1.105 | -0.033 |
| -0.464955712731402 | -0.448 | 1.102 | -0.031 |
| -0.458672527424222 | -0.443 | 1.1 | -0.03 |
| -0.452389342117042 | -0.437 | 1.097 | -0.029 |
| -0.446106156809863 | -0.431 | 1.095 | -0.028 |
| -0.439822971502683 | -0.426 | 1.092 | -0.027 |
| -0.433539786195504 | -0.42 | 1.09 | -0.026 |
| -0.427256600888324 | -0.414 | 1.087 | -0.025 |
| -0.420973415581144 | -0.409 | 1.085 | -0.024 |
| -0.414690230273965 | -0.403 | 1.082 | -0.023 |
| -0.408407044966785 | -0.397 | 1.08 | -0.022 |
| -0.402123859659606 | -0.391 | 1.078 | -0.021 |
| -0.395840674352426 | -0.386 | 1.075 | -0.02 |
| -0.389557489045247 | -0.38 | 1.073 | -0.019 |
| -0.383274303738067 | -0.374 | 1.071 | -0.018 |
| -0.376991118430887 | -0.368 | 1.069 | -0.017 |
| -0.370707933123708 | -0.362 | 1.066 | -0.016 |
| -0.364424747816528 | -0.356 | 1.064 | -0.015 |
| -0.358141562509349 | -0.351 | 1.062 | -0.015 |
| -0.351858377202169 | -0.345 | 1.06 | -0.014 |
| -0.345575191894989 | -0.339 | 1.058 | -0.013 |
| -0.33929200658781 | -0.333 | 1.056 | -0.013 |
| -0.33300882128063 | -0.327 | 1.054 | -0.012 |
| -0.326725635973451 | -0.321 | 1.052 | -0.011 |
| -0.320442450666271 | -0.315 | 1.05 | -0.011 |
| -0.314159265359092 | -0.309 | 1.048 | -0.01 |
| -0.307876080051912 | -0.303 | 1.046 | -0.009 |
| -0.301592894744732 | -0.297 | 1.044 | -0.009 |
| -0.295309709437553 | -0.291 | 1.043 | -0.008 |
| -0.289026524130373 | -0.285 | 1.041 | -0.008 |
| -0.282743338823194 | -0.279 | 1.039 | -0.007 |
| -0.276460153516014 | -0.273 | 1.037 | -0.007 |
| -0.270176968208834 | -0.267 | 1.036 | -0.006 |
| -0.263893782901655 | -0.261 | 1.034 | -0.006 |
| -0.257610597594475 | -0.255 | 1.033 | -0.006 |
| -0.251327412287296 | -0.249 | 1.031 | -0.005 |
| -0.245044226980116 | -0.243 | 1.03 | -0.005 |
| -0.238761041672937 | -0.236 | 1.028 | -0.004 |
| -0.232477856365757 | -0.23 | 1.027 | -0.004 |
| -0.226194671058577 | -0.224 | 1.025 | -0.004 |
| -0.219911485751398 | -0.218 | 1.024 | -0.003 |
| -0.213628300444218 | -0.212 | 1.023 | -0.003 |
| -0.207345115137039 | -0.206 | 1.021 | -0.003 |
| -0.201061929829859 | -0.2 | 1.02 | -0.003 |
| -0.194778744522679 | -0.194 | 1.019 | -0.002 |
| -0.1884955592155 | -0.187 | 1.018 | -0.002 |
| -0.18221237390832 | -0.181 | 1.016 | -0.002 |
| -0.175929188601141 | -0.175 | 1.015 | -0.002 |
| -0.169646003293961 | -0.169 | 1.014 | -0.002 |
| -0.163362817986782 | -0.163 | 1.013 | -0.001 |
| -0.157079632679602 | -0.156 | 1.012 | -0.001 |
| -0.150796447372422 | -0.15 | 1.011 | -0.001 |
| -0.144513262065243 | -0.144 | 1.01 | -0.001 |
| -0.138230076758063 | -0.138 | 1.01 | -0.001 |
| -0.131946891450884 | -0.132 | 1.009 | -0.001 |
| -0.125663706143704 | -0.125 | 1.008 | -0.001 |
| -0.119380520836524 | -0.119 | 1.007 | -0.001 |
| -0.113097335529345 | -0.113 | 1.006 | 0 |
| -0.106814150222165 | -0.107 | 1.006 | 0 |
| -0.100530964914986 | -0.1 | 1.005 | 0 |
| -0.0942477796078061 | -0.094 | 1.004 | 0 |
| -0.0879645943006265 | -0.088 | 1.004 | 0 |
| -0.0816814089934469 | -0.082 | 1.003 | 0 |
| -0.0753982236862674 | -0.075 | 1.003 | 0 |
| -0.0691150383790878 | -0.069 | 1.002 | 0 |
| -0.0628318530719082 | -0.063 | 1.002 | 0 |
| -0.0565486677647286 | -0.057 | 1.002 | 0 |
| -0.050265482457549 | -0.05 | 1.001 | 0 |
| -0.0439822971503694 | -0.044 | 1.001 | 0 |
| -0.0376991118431899 | -0.038 | 1.001 | 0 |
| -0.0314159265360103 | -0.031 | 1 | 0 |
| -0.0251327412288307 | -0.025 | 1 | 0 |
| -0.0188495559216511 | -0.019 | 1 | 0 |
| -0.0125663706144715 | -0.013 | 1 | 0 |
| -0.00628318530729192 | -0.006 | 1 | 0 |
| -1.12338957580782e-13 | 0 | 1 | 0 |
| 0.00628318530706725 | 0.006 | 1 | 0 |
| 0.0125663706142468 | 0.013 | 1 | 0 |
| 0.0188495559214264 | 0.019 | 1 | 0 |
| 0.025132741228606 | 0.025 | 1 | 0 |
| 0.0314159265357856 | 0.031 | 1 | 0 |
| 0.0376991118429652 | 0.038 | 1.001 | 0 |
| 0.0439822971501448 | 0.044 | 1.001 | 0 |
| 0.0502654824573243 | 0.05 | 1.001 | 0 |
| 0.0565486677645039 | 0.057 | 1.002 | 0 |
| 0.0628318530716835 | 0.063 | 1.002 | 0 |
| 0.0691150383788631 | 0.069 | 1.002 | 0 |
| 0.0753982236860427 | 0.075 | 1.003 | 0 |
| 0.0816814089932222 | 0.082 | 1.003 | 0 |
| 0.0879645943004018 | 0.088 | 1.004 | 0 |
| 0.0942477796075814 | 0.094 | 1.004 | 0 |
| 0.100530964914761 | 0.1 | 1.005 | 0 |
| 0.106814150221941 | 0.107 | 1.006 | 0 |
| 0.11309733552912 | 0.113 | 1.006 | 0 |
| 0.1193805208363 | 0.119 | 1.007 | 0.001 |
| 0.125663706143479 | 0.125 | 1.008 | 0.001 |
| 0.131946891450659 | 0.132 | 1.009 | 0.001 |
| 0.138230076757839 | 0.138 | 1.01 | 0.001 |
| 0.144513262065018 | 0.144 | 1.01 | 0.001 |
| 0.150796447372198 | 0.15 | 1.011 | 0.001 |
| 0.157079632679377 | 0.156 | 1.012 | 0.001 |
| 0.163362817986557 | 0.163 | 1.013 | 0.001 |
| 0.169646003293736 | 0.169 | 1.014 | 0.002 |
| 0.175929188600916 | 0.175 | 1.015 | 0.002 |
| 0.182212373908096 | 0.181 | 1.016 | 0.002 |
| 0.188495559215275 | 0.187 | 1.018 | 0.002 |
| 0.194778744522455 | 0.194 | 1.019 | 0.002 |
| 0.201061929829634 | 0.2 | 1.02 | 0.003 |
| 0.207345115136814 | 0.206 | 1.021 | 0.003 |
| 0.213628300443994 | 0.212 | 1.023 | 0.003 |
| 0.219911485751173 | 0.218 | 1.024 | 0.003 |
| 0.226194671058353 | 0.224 | 1.025 | 0.004 |
| 0.232477856365532 | 0.23 | 1.027 | 0.004 |
| 0.238761041672712 | 0.236 | 1.028 | 0.004 |
| 0.245044226979891 | 0.243 | 1.03 | 0.005 |
| 0.251327412287071 | 0.249 | 1.031 | 0.005 |
| 0.257610597594251 | 0.255 | 1.033 | 0.006 |
| 0.26389378290143 | 0.261 | 1.034 | 0.006 |
| 0.27017696820861 | 0.267 | 1.036 | 0.006 |
| 0.276460153515789 | 0.273 | 1.037 | 0.007 |
| 0.282743338822969 | 0.279 | 1.039 | 0.007 |
| 0.289026524130149 | 0.285 | 1.041 | 0.008 |
| 0.295309709437328 | 0.291 | 1.043 | 0.008 |
| 0.301592894744508 | 0.297 | 1.044 | 0.009 |
| 0.307876080051687 | 0.303 | 1.046 | 0.009 |
| 0.314159265358867 | 0.309 | 1.048 | 0.01 |
| 0.320442450666046 | 0.315 | 1.05 | 0.011 |
| 0.326725635973226 | 0.321 | 1.052 | 0.011 |
| 0.333008821280406 | 0.327 | 1.054 | 0.012 |
| 0.339292006587585 | 0.333 | 1.056 | 0.013 |
| 0.345575191894765 | 0.339 | 1.058 | 0.013 |
| 0.351858377201944 | 0.345 | 1.06 | 0.014 |
| 0.358141562509124 | 0.351 | 1.062 | 0.015 |
| 0.364424747816304 | 0.356 | 1.064 | 0.015 |
| 0.370707933123483 | 0.362 | 1.066 | 0.016 |
| 0.376991118430663 | 0.368 | 1.069 | 0.017 |
| 0.383274303737842 | 0.374 | 1.071 | 0.018 |
| 0.389557489045022 | 0.38 | 1.073 | 0.019 |
| 0.395840674352201 | 0.386 | 1.075 | 0.02 |
| 0.402123859659381 | 0.391 | 1.078 | 0.021 |
| 0.408407044966561 | 0.397 | 1.08 | 0.022 |
| 0.41469023027374 | 0.403 | 1.082 | 0.023 |
| 0.42097341558092 | 0.409 | 1.085 | 0.024 |
| 0.427256600888099 | 0.414 | 1.087 | 0.025 |
| 0.433539786195279 | 0.42 | 1.09 | 0.026 |
| 0.439822971502459 | 0.426 | 1.092 | 0.027 |
| 0.446106156809638 | 0.431 | 1.095 | 0.028 |
| 0.452389342116818 | 0.437 | 1.097 | 0.029 |
| 0.458672527423997 | 0.443 | 1.1 | 0.03 |
| 0.464955712731177 | 0.448 | 1.102 | 0.031 |
| 0.471238898038356 | 0.454 | 1.105 | 0.033 |
| 0.477522083345536 | 0.46 | 1.108 | 0.034 |
| 0.483805268652716 | 0.465 | 1.11 | 0.035 |
| 0.490088453959895 | 0.471 | 1.113 | 0.036 |
| 0.496371639267075 | 0.476 | 1.116 | 0.038 |
| 0.502654824574254 | 0.482 | 1.118 | 0.039 |
| 0.508938009881434 | 0.487 | 1.121 | 0.041 |
| 0.515221195188614 | 0.493 | 1.124 | 0.042 |
| 0.521504380495793 | 0.498 | 1.127 | 0.043 |
| 0.527787565802973 | 0.504 | 1.13 | 0.045 |
| 0.534070751110153 | 0.509 | 1.133 | 0.047 |
| 0.540353936417332 | 0.514 | 1.136 | 0.048 |
| 0.546637121724512 | 0.52 | 1.138 | 0.05 |
| 0.552920307031692 | 0.525 | 1.141 | 0.051 |
| 0.559203492338871 | 0.531 | 1.144 | 0.053 |
| 0.565486677646051 | 0.536 | 1.147 | 0.055 |
| 0.571769862953231 | 0.541 | 1.15 | 0.056 |
| 0.57805304826041 | 0.546 | 1.153 | 0.058 |
| 0.58433623356759 | 0.552 | 1.156 | 0.06 |
| 0.590619418874769 | 0.557 | 1.159 | 0.062 |
| 0.596902604181949 | 0.562 | 1.163 | 0.063 |
| 0.603185789489129 | 0.567 | 1.166 | 0.065 |
| 0.609468974796308 | 0.572 | 1.169 | 0.067 |
| 0.615752160103488 | 0.578 | 1.172 | 0.069 |
| 0.622035345410668 | 0.583 | 1.175 | 0.071 |
| 0.628318530717847 | 0.588 | 1.178 | 0.073 |
| 0.634601716025027 | 0.593 | 1.182 | 0.075 |
| 0.640884901332206 | 0.598 | 1.185 | 0.077 |
| 0.647168086639386 | 0.603 | 1.188 | 0.079 |
| 0.653451271946566 | 0.608 | 1.191 | 0.081 |
| 0.659734457253745 | 0.613 | 1.195 | 0.084 |
| 0.666017642560925 | 0.618 | 1.198 | 0.086 |
| 0.672300827868105 | 0.623 | 1.201 | 0.088 |
| 0.678584013175284 | 0.628 | 1.204 | 0.09 |
| 0.684867198482464 | 0.633 | 1.208 | 0.092 |
| 0.691150383789644 | 0.637 | 1.211 | 0.095 |
| 0.697433569096823 | 0.642 | 1.214 | 0.097 |
| 0.703716754404003 | 0.647 | 1.218 | 0.099 |
| 0.709999939711183 | 0.652 | 1.221 | 0.102 |
| 0.716283125018362 | 0.657 | 1.225 | 0.104 |
| 0.722566310325542 | 0.661 | 1.228 | 0.107 |
| 0.728849495632721 | 0.666 | 1.231 | 0.109 |
| 0.735132680939901 | 0.671 | 1.235 | 0.112 |
| 0.741415866247081 | 0.675 | 1.238 | 0.114 |
| 0.74769905155426 | 0.68 | 1.242 | 0.117 |
| 0.75398223686144 | 0.685 | 1.245 | 0.119 |
| 0.76026542216862 | 0.689 | 1.249 | 0.122 |
| 0.766548607475799 | 0.694 | 1.252 | 0.125 |
| 0.772831792782979 | 0.698 | 1.256 | 0.127 |
| 0.779114978090159 | 0.703 | 1.259 | 0.13 |
| 0.785398163397338 | 0.707 | 1.262 | 0.133 |
| 0.791681348704518 | 0.712 | 1.266 | 0.135 |
| 0.797964534011697 | 0.716 | 1.269 | 0.138 |
| 0.804247719318877 | 0.72 | 1.273 | 0.141 |
| 0.810530904626057 | 0.725 | 1.276 | 0.144 |
| 0.816814089933236 | 0.729 | 1.28 | 0.147 |
| 0.823097275240416 | 0.733 | 1.283 | 0.15 |
| 0.829380460547596 | 0.738 | 1.287 | 0.153 |
| 0.835663645854775 | 0.742 | 1.291 | 0.155 |
| 0.841946831161955 | 0.746 | 1.294 | 0.158 |
| 0.848230016469135 | 0.75 | 1.298 | 0.161 |
| 0.854513201776314 | 0.754 | 1.301 | 0.164 |
| 0.860796387083494 | 0.758 | 1.305 | 0.167 |
| 0.867079572390674 | 0.762 | 1.308 | 0.17 |
| 0.873362757697853 | 0.766 | 1.312 | 0.174 |
| 0.879645943005033 | 0.771 | 1.315 | 0.177 |
| 0.885929128312212 | 0.775 | 1.319 | 0.18 |
| 0.892212313619392 | 0.778 | 1.322 | 0.183 |
| 0.898495498926572 | 0.782 | 1.326 | 0.186 |
| 0.904778684233751 | 0.786 | 1.329 | 0.189 |
| 0.911061869540931 | 0.79 | 1.333 | 0.192 |
| 0.917345054848111 | 0.794 | 1.336 | 0.196 |
| 0.92362824015529 | 0.798 | 1.34 | 0.199 |
| 0.92991142546247 | 0.802 | 1.343 | 0.202 |
| 0.93619461076965 | 0.805 | 1.347 | 0.205 |
| 0.942477796076829 | 0.809 | 1.35 | 0.209 |
| 0.948760981384009 | 0.813 | 1.354 | 0.212 |
| 0.955044166691188 | 0.816 | 1.357 | 0.215 |
| 0.961327351998368 | 0.82 | 1.361 | 0.218 |
| 0.967610537305548 | 0.824 | 1.364 | 0.222 |
| 0.973893722612727 | 0.827 | 1.368 | 0.225 |
| 0.980176907919907 | 0.831 | 1.371 | 0.228 |
| 0.986460093227087 | 0.834 | 1.374 | 0.232 |
| 0.992743278534266 | 0.838 | 1.378 | 0.235 |
| 0.999026463841446 | 0.841 | 1.381 | 0.239 |
| 1.005309649148626 | 0.844 | 1.385 | 0.242 |
| 1.011592834455805 | 0.848 | 1.388 | 0.245 |
| 1.017876019762985 | 0.851 | 1.391 | 0.249 |
| 1.024159205070164 | 0.854 | 1.395 | 0.252 |
| 1.030442390377344 | 0.858 | 1.398 | 0.256 |
| 1.036725575684524 | 0.861 | 1.401 | 0.259 |
| 1.043008760991703 | 0.864 | 1.405 | 0.263 |
| 1.049291946298883 | 0.867 | 1.408 | 0.266 |
| 1.055575131606063 | 0.87 | 1.411 | 0.269 |
| 1.061858316913242 | 0.873 | 1.415 | 0.273 |
| 1.068141502220422 | 0.876 | 1.418 | 0.276 |
| 1.074424687527602 | 0.879 | 1.421 | 0.28 |
| 1.080707872834781 | 0.882 | 1.424 | 0.283 |
| 1.086991058141961 | 0.885 | 1.427 | 0.287 |
| 1.09327424344914 | 0.888 | 1.431 | 0.29 |
| 1.09955742875632 | 0.891 | 1.434 | 0.294 |
| 1.1058406140635 | 0.894 | 1.437 | 0.297 |
| 1.112123799370679 | 0.897 | 1.44 | 0.301 |
| 1.11840698467786 | 0.899 | 1.443 | 0.304 |
| 1.124690169985039 | 0.902 | 1.446 | 0.307 |
| 1.130973355292218 | 0.905 | 1.449 | 0.311 |
| 1.137256540599398 | 0.907 | 1.452 | 0.314 |
| 1.143539725906578 | 0.91 | 1.455 | 0.318 |
| 1.149822911213757 | 0.913 | 1.458 | 0.321 |
| 1.156106096520937 | 0.915 | 1.461 | 0.324 |
| 1.162389281828116 | 0.918 | 1.464 | 0.328 |
| 1.168672467135296 | 0.92 | 1.467 | 0.331 |
| 1.174955652442476 | 0.923 | 1.47 | 0.335 |
| 1.181238837749655 | 0.925 | 1.473 | 0.338 |
| 1.187522023056835 | 0.927 | 1.475 | 0.341 |
| 1.193805208364015 | 0.93 | 1.478 | 0.344 |
| 1.200088393671194 | 0.932 | 1.481 | 0.348 |
| 1.206371578978374 | 0.934 | 1.484 | 0.351 |
| 1.212654764285554 | 0.937 | 1.486 | 0.354 |
| 1.218937949592733 | 0.939 | 1.489 | 0.358 |
| 1.225221134899913 | 0.941 | 1.492 | 0.361 |
| 1.231504320207093 | 0.943 | 1.494 | 0.364 |
| 1.237787505514272 | 0.945 | 1.497 | 0.367 |
| 1.244070690821452 | 0.947 | 1.499 | 0.37 |
| 1.250353876128631 | 0.949 | 1.502 | 0.373 |
| 1.256637061435811 | 0.951 | 1.504 | 0.376 |
| 1.262920246742991 | 0.953 | 1.507 | 0.379 |
| 1.26920343205017 | 0.955 | 1.509 | 0.382 |
| 1.27548661735735 | 0.957 | 1.511 | 0.385 |
| 1.28176980266453 | 0.959 | 1.514 | 0.388 |
| 1.28805298797171 | 0.96 | 1.516 | 0.391 |
| 1.294336173278889 | 0.962 | 1.518 | 0.394 |
| 1.300619358586069 | 0.964 | 1.52 | 0.397 |
| 1.306902543893248 | 0.965 | 1.523 | 0.4 |
| 1.313185729200428 | 0.967 | 1.525 | 0.403 |
| 1.319468914507607 | 0.969 | 1.527 | 0.405 |
| 1.325752099814787 | 0.97 | 1.529 | 0.408 |
| 1.332035285121967 | 0.972 | 1.531 | 0.411 |
| 1.338318470429146 | 0.973 | 1.533 | 0.413 |
| 1.344601655736326 | 0.975 | 1.535 | 0.416 |
| 1.350884841043506 | 0.976 | 1.536 | 0.418 |
| 1.357168026350685 | 0.977 | 1.538 | 0.421 |
| 1.363451211657865 | 0.979 | 1.54 | 0.423 |
| 1.369734396965045 | 0.98 | 1.542 | 0.426 |
| 1.376017582272224 | 0.981 | 1.544 | 0.428 |
| 1.382300767579404 | 0.982 | 1.545 | 0.43 |
| 1.388583952886583 | 0.983 | 1.547 | 0.433 |
| 1.394867138193763 | 0.985 | 1.548 | 0.435 |
| 1.401150323500943 | 0.986 | 1.55 | 0.437 |
| 1.407433508808122 | 0.987 | 1.551 | 0.439 |
| 1.413716694115302 | 0.988 | 1.553 | 0.441 |
| 1.419999879422482 | 0.989 | 1.554 | 0.443 |
| 1.426283064729661 | 0.99 | 1.555 | 0.445 |
| 1.432566250036841 | 0.99 | 1.557 | 0.447 |
| 1.438849435344021 | 0.991 | 1.558 | 0.448 |
| 1.4451326206512 | 0.992 | 1.559 | 0.45 |
| 1.45141580595838 | 0.993 | 1.56 | 0.452 |
| 1.45769899126556 | 0.994 | 1.561 | 0.453 |
| 1.46398217657274 | 0.994 | 1.562 | 0.455 |
| 1.470265361879919 | 0.995 | 1.563 | 0.456 |
| 1.476548547187098 | 0.996 | 1.564 | 0.457 |
| 1.482831732494278 | 0.996 | 1.565 | 0.459 |
| 1.489114917801458 | 0.997 | 1.566 | 0.46 |
| 1.495398103108637 | 0.997 | 1.566 | 0.461 |
| 1.501681288415817 | 0.998 | 1.567 | 0.462 |
| 1.507964473722997 | 0.998 | 1.568 | 0.463 |
| 1.514247659030176 | 0.998 | 1.568 | 0.464 |
| 1.520530844337356 | 0.999 | 1.569 | 0.464 |
| 1.526814029644536 | 0.999 | 1.569 | 0.465 |
| 1.533097214951715 | 0.999 | 1.57 | 0.466 |
| 1.539380400258895 | 1 | 1.57 | 0.466 |
| 1.545663585566075 | 1 | 1.57 | 0.467 |
| 1.551946770873254 | 1 | 1.571 | 0.467 |
| 1.558229956180434 | 1 | 1.571 | 0.467 |
| 1.564513141487613 | 1 | 1.571 | 0.467 |
| 1.570796326794793 | 1 | 1.571 | 0.467 |
| 1.577079512101973 | 1 | 1.571 | 0.467 |
| 1.583362697409152 | 1 | 1.571 | 0.467 |
| 1.589645882716332 | 1 | 1.571 | 0.467 |
| 1.595929068023512 | 1 | 1.57 | 0.467 |
| 1.602212253330691 | 1 | 1.57 | 0.466 |
| 1.608495438637871 | 0.999 | 1.57 | 0.466 |
| 1.61477862394505 | 0.999 | 1.569 | 0.465 |
| 1.62106180925223 | 0.999 | 1.569 | 0.464 |
| 1.62734499455941 | 0.998 | 1.568 | 0.463 |
| 1.633628179866589 | 0.998 | 1.568 | 0.462 |
| 1.63991136517377 | 0.998 | 1.567 | 0.461 |
| 1.646194550480949 | 0.997 | 1.566 | 0.46 |
| 1.652477735788128 | 0.997 | 1.565 | 0.459 |
| 1.658760921095308 | 0.996 | 1.564 | 0.457 |
| 1.665044106402488 | 0.996 | 1.564 | 0.456 |
| 1.671327291709667 | 0.995 | 1.563 | 0.454 |
| 1.677610477016847 | 0.994 | 1.561 | 0.452 |
| 1.683893662324026 | 0.994 | 1.56 | 0.45 |
| 1.690176847631206 | 0.993 | 1.559 | 0.448 |
| 1.696460032938386 | 0.992 | 1.558 | 0.446 |
| 1.702743218245565 | 0.991 | 1.556 | 0.443 |
| 1.709026403552745 | 0.99 | 1.555 | 0.441 |
| 1.715309588859925 | 0.99 | 1.553 | 0.438 |
| 1.721592774167104 | 0.989 | 1.552 | 0.436 |
| 1.727875959474284 | 0.988 | 1.55 | 0.433 |
| 1.734159144781464 | 0.987 | 1.548 | 0.43 |
| 1.740442330088643 | 0.986 | 1.547 | 0.427 |
| 1.746725515395823 | 0.985 | 1.545 | 0.423 |
| 1.753008700703003 | 0.983 | 1.543 | 0.42 |
| 1.759291886010182 | 0.982 | 1.541 | 0.416 |
| 1.765575071317362 | 0.981 | 1.539 | 0.413 |
| 1.771858256624541 | 0.98 | 1.536 | 0.409 |
| 1.778141441931721 | 0.979 | 1.534 | 0.405 |
| 1.784424627238901 | 0.977 | 1.532 | 0.401 |
| 1.79070781254608 | 0.976 | 1.529 | 0.396 |
| 1.79699099785326 | 0.975 | 1.527 | 0.392 |
| 1.80327418316044 | 0.973 | 1.524 | 0.387 |
| 1.809557368467619 | 0.972 | 1.522 | 0.382 |
| 1.815840553774799 | 0.97 | 1.519 | 0.377 |
| 1.822123739081979 | 0.969 | 1.516 | 0.372 |
| 1.828406924389158 | 0.967 | 1.513 | 0.367 |
| 1.834690109696338 | 0.965 | 1.51 | 0.362 |
| 1.840973295003518 | 0.964 | 1.507 | 0.356 |
| 1.847256480310697 | 0.962 | 1.504 | 0.35 |
| 1.853539665617877 | 0.96 | 1.501 | 0.344 |
| 1.859822850925056 | 0.959 | 1.498 | 0.338 |
| 1.866106036232236 | 0.957 | 1.494 | 0.332 |
| 1.872389221539416 | 0.955 | 1.491 | 0.326 |
| 1.878672406846595 | 0.953 | 1.487 | 0.319 |
| 1.884955592153775 | 0.951 | 1.484 | 0.312 |
| 1.891238777460955 | 0.949 | 1.48 | 0.305 |
| 1.897521962768134 | 0.947 | 1.476 | 0.298 |
| 1.903805148075314 | 0.945 | 1.472 | 0.291 |
| 1.910088333382494 | 0.943 | 1.468 | 0.283 |
| 1.916371518689673 | 0.941 | 1.464 | 0.275 |
| 1.922654703996853 | 0.939 | 1.46 | 0.267 |
| 1.928937889304033 | 0.937 | 1.456 | 0.259 |
| 1.935221074611212 | 0.934 | 1.452 | 0.251 |
| 1.941504259918392 | 0.932 | 1.447 | 0.243 |
| 1.947787445225571 | 0.93 | 1.443 | 0.234 |
| 1.954070630532751 | 0.927 | 1.438 | 0.225 |
| 1.960353815839931 | 0.925 | 1.434 | 0.216 |
| 1.96663700114711 | 0.923 | 1.429 | 0.207 |
| 1.97292018645429 | 0.92 | 1.424 | 0.197 |
| 1.97920337176147 | 0.918 | 1.419 | 0.187 |
| 1.985486557068649 | 0.915 | 1.414 | 0.178 |
| 1.991769742375829 | 0.913 | 1.409 | 0.168 |
| 1.998052927683009 | 0.91 | 1.404 | 0.157 |
| 2.004336112990188 | 0.907 | 1.399 | 0.147 |
| 2.010619298297368 | 0.905 | 1.393 | 0.136 |
| 2.016902483604547 | 0.902 | 1.388 | 0.125 |
| 2.023185668911727 | 0.899 | 1.383 | 0.114 |
| 2.029468854218907 | 0.897 | 1.377 | 0.103 |
| 2.035752039526086 | 0.894 | 1.371 | 0.091 |
| 2.042035224833266 | 0.891 | 1.365 | 0.079 |
| 2.048318410140446 | 0.888 | 1.36 | 0.067 |
| 2.054601595447625 | 0.885 | 1.354 | 0.055 |
| 2.060884780754805 | 0.882 | 1.348 | 0.043 |
| 2.067167966061984 | 0.879 | 1.341 | 0.03 |
| 2.073451151369164 | 0.876 | 1.335 | 0.017 |
| 2.079734336676344 | 0.873 | 1.329 | 0.004 |
| 2.086017521983524 | 0.87 | 1.322 | -0.009 |
| 2.092300707290703 | 0.867 | 1.316 | -0.023 |
| 2.098583892597883 | 0.864 | 1.309 | -0.037 |
| 2.104867077905062 | 0.861 | 1.303 | -0.051 |
| 2.111150263212242 | 0.858 | 1.296 | -0.065 |
| 2.117433448519422 | 0.854 | 1.289 | -0.08 |
| 2.123716633826601 | 0.851 | 1.282 | -0.095 |
| 2.129999819133781 | 0.848 | 1.275 | -0.11 |
| 2.136283004440961 | 0.844 | 1.268 | -0.125 |
| 2.14256618974814 | 0.841 | 1.261 | -0.14 |
| 2.14884937505532 | 0.838 | 1.253 | -0.156 |
| 2.1551325603625 | 0.834 | 1.246 | -0.172 |
| 2.16141574566968 | 0.831 | 1.238 | -0.188 |
| 2.167698930976859 | 0.827 | 1.231 | -0.205 |
| 2.173982116284038 | 0.824 | 1.223 | -0.221 |
| 2.180265301591218 | 0.82 | 1.215 | -0.238 |
| 2.186548486898398 | 0.816 | 1.207 | -0.256 |
| 2.192831672205577 | 0.813 | 1.199 | -0.273 |
| 2.199114857512757 | 0.809 | 1.191 | -0.291 |
| 2.205398042819936 | 0.805 | 1.183 | -0.309 |
| 2.211681228127116 | 0.802 | 1.175 | -0.327 |
| 2.217964413434296 | 0.798 | 1.167 | -0.345 |
| 2.224247598741475 | 0.794 | 1.158 | -0.364 |
| 2.230530784048655 | 0.79 | 1.15 | -0.383 |
| 2.236813969355835 | 0.786 | 1.141 | -0.403 |
| 2.243097154663014 | 0.782 | 1.132 | -0.422 |
| 2.249380339970194 | 0.778 | 1.123 | -0.442 |
| 2.255663525277374 | 0.775 | 1.114 | -0.462 |
| 2.261946710584553 | 0.771 | 1.105 | -0.482 |
| 2.268229895891733 | 0.766 | 1.096 | -0.503 |
| 2.274513081198912 | 0.762 | 1.087 | -0.524 |
| 2.280796266506092 | 0.758 | 1.078 | -0.545 |
| 2.287079451813272 | 0.754 | 1.068 | -0.567 |
| 2.293362637120452 | 0.75 | 1.059 | -0.588 |
| 2.299645822427631 | 0.746 | 1.049 | -0.61 |
| 2.305929007734811 | 0.742 | 1.04 | -0.633 |
| 2.312212193041991 | 0.738 | 1.03 | -0.655 |
| 2.31849537834917 | 0.733 | 1.02 | -0.678 |
| 2.32477856365635 | 0.729 | 1.01 | -0.701 |
| 2.331061748963529 | 0.725 | 1 | -0.724 |
| 2.337344934270709 | 0.72 | 0.99 | -0.748 |
| 2.343628119577889 | 0.716 | 0.98 | -0.772 |
| 2.349911304885068 | 0.712 | 0.969 | -0.796 |
| 2.356194490192248 | 0.707 | 0.959 | -0.821 |
| 2.362477675499428 | 0.703 | 0.948 | -0.846 |
| 2.368760860806607 | 0.698 | 0.938 | -0.871 |
| 2.375044046113787 | 0.694 | 0.927 | -0.896 |
| 2.381327231420966 | 0.689 | 0.916 | -0.922 |
| 2.387610416728146 | 0.685 | 0.905 | -0.948 |
| 2.393893602035326 | 0.68 | 0.894 | -0.974 |
| 2.400176787342505 | 0.675 | 0.883 | -1 |
| 2.406459972649685 | 0.671 | 0.872 | -1.027 |
| 2.412743157956865 | 0.666 | 0.861 | -1.054 |
| 2.419026343264044 | 0.661 | 0.85 | -1.082 |
| 2.425309528571224 | 0.657 | 0.838 | -1.11 |
| 2.431592713878404 | 0.652 | 0.827 | -1.138 |
| 2.437875899185583 | 0.647 | 0.815 | -1.166 |
| 2.444159084492763 | 0.642 | 0.803 | -1.195 |
| 2.450442269799943 | 0.637 | 0.791 | -1.224 |
| 2.456725455107122 | 0.633 | 0.78 | -1.253 |
| 2.463008640414302 | 0.628 | 0.768 | -1.282 |
| 2.469291825721482 | 0.623 | 0.755 | -1.312 |
| 2.475575011028661 | 0.618 | 0.743 | -1.342 |
| 2.481858196335841 | 0.613 | 0.731 | -1.373 |
| 2.48814138164302 | 0.608 | 0.719 | -1.403 |
| 2.4944245669502 | 0.603 | 0.706 | -1.434 |
| 2.50070775225738 | 0.598 | 0.694 | -1.466 |
| 2.506990937564559 | 0.593 | 0.681 | -1.497 |
| 2.51327412287174 | 0.588 | 0.668 | -1.529 |
| 2.519557308178919 | 0.583 | 0.655 | -1.562 |
| 2.525840493486098 | 0.578 | 0.643 | -1.594 |
| 2.532123678793278 | 0.572 | 0.63 | -1.627 |
| 2.538406864100458 | 0.567 | 0.616 | -1.66 |
| 2.544690049407637 | 0.562 | 0.603 | -1.694 |
| 2.550973234714817 | 0.557 | 0.59 | -1.728 |
| 2.557256420021996 | 0.552 | 0.577 | -1.762 |
| 2.563539605329176 | 0.546 | 0.563 | -1.796 |
| 2.569822790636356 | 0.541 | 0.55 | -1.831 |
| 2.576105975943535 | 0.536 | 0.536 | -1.866 |
| 2.582389161250715 | 0.531 | 0.522 | -1.901 |
| 2.588672346557895 | 0.525 | 0.509 | -1.937 |
| 2.594955531865074 | 0.52 | 0.495 | -1.973 |
| 2.601238717172254 | 0.514 | 0.481 | -2.009 |
| 2.607521902479433 | 0.509 | 0.467 | -2.046 |
| 2.613805087786613 | 0.504 | 0.452 | -2.083 |
| 2.620088273093793 | 0.498 | 0.438 | -2.12 |
| 2.626371458400972 | 0.493 | 0.424 | -2.158 |
| 2.632654643708152 | 0.487 | 0.409 | -2.195 |
| 2.638937829015332 | 0.482 | 0.395 | -2.234 |
| 2.645221014322511 | 0.476 | 0.38 | -2.272 |
| 2.651504199629691 | 0.471 | 0.366 | -2.311 |
| 2.657787384936871 | 0.465 | 0.351 | -2.35 |
| 2.66407057024405 | 0.46 | 0.336 | -2.39 |
| 2.67035375555123 | 0.454 | 0.321 | -2.429 |
| 2.67663694085841 | 0.448 | 0.306 | -2.469 |
| 2.682920126165589 | 0.443 | 0.291 | -2.51 |
| 2.689203311472769 | 0.437 | 0.276 | -2.55 |
| 2.695486496779948 | 0.431 | 0.261 | -2.591 |
| 2.701769682087128 | 0.426 | 0.246 | -2.633 |
| 2.708052867394308 | 0.42 | 0.23 | -2.674 |
| 2.714336052701487 | 0.414 | 0.215 | -2.716 |
| 2.720619238008667 | 0.409 | 0.199 | -2.759 |
| 2.726902423315847 | 0.403 | 0.183 | -2.801 |
| 2.733185608623026 | 0.397 | 0.168 | -2.844 |
| 2.739468793930206 | 0.391 | 0.152 | -2.888 |
| 2.745751979237386 | 0.386 | 0.136 | -2.931 |
| 2.752035164544565 | 0.38 | 0.12 | -2.975 |
| 2.758318349851745 | 0.374 | 0.104 | -3.019 |
| 2.764601535158925 | 0.368 | 0.088 | -3.064 |
| 2.770884720466104 | 0.362 | 0.072 | -3.108 |
| 2.777167905773284 | 0.356 | 0.055 | -3.154 |
| 2.783451091080463 | 0.351 | 0.039 | -3.199 |
| 2.789734276387643 | 0.345 | 0.023 | -3.245 |
| 2.796017461694823 | 0.339 | 0.006 | -3.291 |
| 2.802300647002002 | 0.333 | -0.01 | -3.337 |
| 2.808583832309182 | 0.327 | -0.027 | -3.384 |
| 2.814867017616362 | 0.321 | -0.044 | -3.431 |
| 2.821150202923541 | 0.315 | -0.06 | -3.478 |
| 2.827433388230721 | 0.309 | -0.077 | -3.526 |
| 2.833716573537901 | 0.303 | -0.094 | -3.574 |
| 2.83999975884508 | 0.297 | -0.111 | -3.622 |
| 2.84628294415226 | 0.291 | -0.128 | -3.67 |
| 2.852566129459439 | 0.285 | -0.145 | -3.719 |
| 2.858849314766619 | 0.279 | -0.163 | -3.768 |
| 2.865132500073799 | 0.273 | -0.18 | -3.818 |
| 2.871415685380978 | 0.267 | -0.197 | -3.868 |
| 2.877698870688158 | 0.261 | -0.215 | -3.918 |
| 2.883982055995337 | 0.255 | -0.232 | -3.968 |
| 2.890265241302517 | 0.249 | -0.25 | -4.019 |
| 2.896548426609697 | 0.243 | -0.267 | -4.07 |
| 2.902831611916877 | 0.236 | -0.285 | -4.121 |
| 2.909114797224056 | 0.23 | -0.303 | -4.173 |
| 2.915397982531236 | 0.224 | -0.321 | -4.225 |
| 2.921681167838416 | 0.218 | -0.339 | -4.277 |
| 2.927964353145595 | 0.212 | -0.357 | -4.329 |
| 2.934247538452775 | 0.206 | -0.375 | -4.382 |
| 2.940530723759954 | 0.2 | -0.393 | -4.435 |
| 2.946813909067134 | 0.194 | -0.411 | -4.489 |
| 2.953097094374314 | 0.187 | -0.429 | -4.542 |
| 2.959380279681493 | 0.181 | -0.447 | -4.596 |
| 2.965663464988673 | 0.175 | -0.466 | -4.65 |
| 2.971946650295853 | 0.169 | -0.484 | -4.705 |
| 2.978229835603032 | 0.163 | -0.502 | -4.76 |
| 2.984513020910212 | 0.156 | -0.521 | -4.815 |
| 2.990796206217391 | 0.15 | -0.539 | -4.87 |
| 2.997079391524571 | 0.144 | -0.558 | -4.926 |
| 3.003362576831751 | 0.138 | -0.577 | -4.982 |
| 3.009645762138931 | 0.132 | -0.595 | -5.038 |
| 3.01592894744611 | 0.125 | -0.614 | -5.095 |
| 3.02221213275329 | 0.119 | -0.633 | -5.152 |
| 3.028495318060469 | 0.113 | -0.652 | -5.209 |
| 3.034778503367649 | 0.107 | -0.671 | -5.266 |
| 3.041061688674829 | 0.1 | -0.69 | -5.324 |
| 3.047344873982008 | 0.094 | -0.709 | -5.382 |
| 3.053628059289188 | 0.088 | -0.728 | -5.44 |
| 3.059911244596367 | 0.082 | -0.747 | -5.499 |
| 3.066194429903547 | 0.075 | -0.766 | -5.557 |
| 3.072477615210727 | 0.069 | -0.785 | -5.616 |
| 3.078760800517906 | 0.063 | -0.805 | -5.676 |
| 3.085043985825086 | 0.057 | -0.824 | -5.735 |
| 3.091327171132266 | 0.05 | -0.843 | -5.795 |
| 3.097610356439445 | 0.044 | -0.863 | -5.855 |
| 3.103893541746625 | 0.038 | -0.882 | -5.916 |
| 3.110176727053805 | 0.031 | -0.902 | -5.976 |
| 3.116459912360984 | 0.025 | -0.921 | -6.037 |
| 3.122743097668164 | 0.019 | -0.941 | -6.098 |
| 3.129026282975343 | 0.013 | -0.961 | -6.16 |
| 3.135309468282523 | 0.006 | -0.98 | -6.221 |
| 3.141592653589703 | 0 | -1 | -6.283 |
| 3.147875838896883 | -0.006 | -1.02 | -6.345 |
| 3.154159024204062 | -0.013 | -1.04 | -6.408 |
| 3.160442209511242 | -0.019 | -1.059 | -6.47 |
| 3.166725394818422 | -0.025 | -1.079 | -6.533 |
| 3.173008580125601 | -0.031 | -1.099 | -6.596 |
| 3.179291765432781 | -0.038 | -1.119 | -6.66 |
| 3.18557495073996 | -0.044 | -1.139 | -6.723 |
| 3.19185813604714 | -0.05 | -1.159 | -6.787 |
| 3.19814132135432 | -0.057 | -1.179 | -6.851 |
| 3.2044245066615 | -0.063 | -1.199 | -6.915 |
| 3.210707691968679 | -0.069 | -1.219 | -6.98 |
| 3.216990877275859 | -0.075 | -1.239 | -7.045 |
| 3.223274062583038 | -0.082 | -1.26 | -7.11 |
| 3.229557247890217 | -0.088 | -1.28 | -7.175 |
| 3.235840433197398 | -0.094 | -1.3 | -7.24 |
| 3.242123618504577 | -0.1 | -1.32 | -7.306 |
| 3.248406803811757 | -0.107 | -1.341 | -7.372 |
| 3.254689989118936 | -0.113 | -1.361 | -7.438 |
| 3.260973174426116 | -0.119 | -1.381 | -7.504 |
| 3.267256359733296 | -0.125 | -1.402 | -7.57 |
| 3.273539545040475 | -0.132 | -1.422 | -7.637 |
| 3.279822730347655 | -0.138 | -1.442 | -7.704 |
| 3.286105915654835 | -0.144 | -1.463 | -7.771 |
| 3.292389100962014 | -0.15 | -1.483 | -7.838 |
| 3.298672286269194 | -0.156 | -1.504 | -7.905 |
| 3.304955471576374 | -0.163 | -1.524 | -7.973 |
| 3.311238656883553 | -0.169 | -1.545 | -8.041 |
| 3.317521842190732 | -0.175 | -1.565 | -8.109 |
| 3.323805027497912 | -0.181 | -1.586 | -8.177 |
| 3.330088212805092 | -0.187 | -1.606 | -8.245 |
| 3.336371398112272 | -0.194 | -1.627 | -8.314 |
| 3.342654583419451 | -0.2 | -1.647 | -8.383 |
| 3.34893776872663 | -0.206 | -1.668 | -8.452 |
| 3.355220954033811 | -0.212 | -1.689 | -8.521 |
| 3.36150413934099 | -0.218 | -1.709 | -8.59 |
| 3.36778732464817 | -0.224 | -1.73 | -8.659 |
| 3.37407050995535 | -0.23 | -1.75 | -8.729 |
| 3.380353695262529 | -0.236 | -1.771 | -8.798 |
| 3.386636880569709 | -0.243 | -1.792 | -8.868 |
| 3.392920065876888 | -0.249 | -1.812 | -8.938 |
| 3.399203251184068 | -0.255 | -1.833 | -9.008 |
| 3.405486436491248 | -0.261 | -1.854 | -9.079 |
| 3.411769621798427 | -0.267 | -1.874 | -9.149 |
| 3.418052807105607 | -0.273 | -1.895 | -9.22 |
| 3.424335992412787 | -0.279 | -1.916 | -9.29 |
| 3.430619177719966 | -0.285 | -1.936 | -9.361 |
| 3.436902363027146 | -0.291 | -1.957 | -9.432 |
| 3.443185548334325 | -0.297 | -1.978 | -9.503 |
| 3.449468733641505 | -0.303 | -1.998 | -9.574 |
| 3.455751918948685 | -0.309 | -2.019 | -9.646 |
| 3.462035104255865 | -0.315 | -2.04 | -9.717 |
| 3.468318289563044 | -0.321 | -2.06 | -9.788 |
| 3.474601474870224 | -0.327 | -2.081 | -9.86 |
| 3.480884660177403 | -0.333 | -2.101 | -9.932 |
| 3.487167845484583 | -0.339 | -2.122 | -10.004 |
| 3.493451030791763 | -0.345 | -2.143 | -10.076 |
| 3.499734216098942 | -0.351 | -2.163 | -10.148 |
| 3.506017401406122 | -0.356 | -2.184 | -10.22 |
| 3.512300586713302 | -0.362 | -2.204 | -10.292 |
| 3.518583772020481 | -0.368 | -2.225 | -10.364 |
| 3.524866957327661 | -0.374 | -2.246 | -10.437 |
| 3.531150142634841 | -0.38 | -2.266 | -10.509 |
| 3.53743332794202 | -0.386 | -2.287 | -10.582 |
| 3.5437165132492 | -0.391 | -2.307 | -10.654 |
| 3.54999969855638 | -0.397 | -2.328 | -10.727 |
| 3.556282883863559 | -0.403 | -2.348 | -10.8 |
| 3.562566069170739 | -0.409 | -2.369 | -10.872 |
| 3.568849254477918 | -0.414 | -2.389 | -10.945 |
| 3.575132439785098 | -0.42 | -2.409 | -11.018 |
| 3.581415625092278 | -0.426 | -2.43 | -11.091 |
| 3.587698810399457 | -0.431 | -2.45 | -11.164 |
| 3.593981995706637 | -0.437 | -2.47 | -11.237 |
| 3.600265181013817 | -0.443 | -2.491 | -11.31 |
| 3.606548366320996 | -0.448 | -2.511 | -11.383 |
| 3.612831551628176 | -0.454 | -2.531 | -11.456 |
| 3.619114736935355 | -0.46 | -2.551 | -11.529 |
| 3.625397922242535 | -0.465 | -2.572 | -11.602 |
| 3.631681107549715 | -0.471 | -2.592 | -11.675 |
| 3.637964292856894 | -0.476 | -2.612 | -11.748 |
| 3.644247478164074 | -0.482 | -2.632 | -11.821 |
| 3.650530663471254 | -0.487 | -2.652 | -11.895 |
| 3.656813848778433 | -0.493 | -2.672 | -11.968 |
| 3.663097034085613 | -0.498 | -2.692 | -12.041 |
| 3.669380219392792 | -0.504 | -2.712 | -12.114 |
| 3.675663404699972 | -0.509 | -2.732 | -12.187 |
| 3.681946590007152 | -0.514 | -2.752 | -12.26 |
| 3.688229775314331 | -0.52 | -2.771 | -12.333 |
| 3.694512960621511 | -0.525 | -2.791 | -12.406 |
| 3.700796145928691 | -0.531 | -2.811 | -12.479 |
| 3.70707933123587 | -0.536 | -2.831 | -12.552 |
| 3.71336251654305 | -0.541 | -2.85 | -12.625 |
| 3.71964570185023 | -0.546 | -2.87 | -12.698 |
| 3.72592888715741 | -0.552 | -2.889 | -12.77 |
| 3.732212072464589 | -0.557 | -2.909 | -12.843 |
| 3.738495257771769 | -0.562 | -2.928 | -12.916 |
| 3.744778443078948 | -0.567 | -2.948 | -12.988 |
| 3.751061628386128 | -0.572 | -2.967 | -13.061 |
| 3.757344813693308 | -0.578 | -2.986 | -13.133 |
| 3.763627999000487 | -0.583 | -3.006 | -13.206 |
| 3.769911184307667 | -0.588 | -3.025 | -13.278 |
| 3.776194369614846 | -0.593 | -3.044 | -13.35 |
| 3.782477554922026 | -0.598 | -3.063 | -13.422 |
| 3.788760740229206 | -0.603 | -3.082 | -13.494 |
| 3.795043925536385 | -0.608 | -3.101 | -13.566 |
| 3.801327110843565 | -0.613 | -3.12 | -13.638 |
| 3.807610296150745 | -0.618 | -3.139 | -13.71 |
| 3.813893481457924 | -0.623 | -3.158 | -13.781 |
| 3.820176666765104 | -0.628 | -3.176 | -13.853 |
| 3.826459852072284 | -0.633 | -3.195 | -13.924 |
| 3.832743037379463 | -0.637 | -3.214 | -13.995 |
| 3.839026222686643 | -0.642 | -3.232 | -14.066 |
| 3.845309407993823 | -0.647 | -3.251 | -14.137 |
| 3.851592593301002 | -0.652 | -3.269 | -14.208 |
| 3.857875778608182 | -0.657 | -3.287 | -14.279 |
| 3.864158963915361 | -0.661 | -3.306 | -14.349 |
| 3.870442149222541 | -0.666 | -3.324 | -14.419 |
| 3.876725334529721 | -0.671 | -3.342 | -14.489 |
| 3.8830085198369 | -0.675 | -3.36 | -14.559 |
| 3.88929170514408 | -0.68 | -3.378 | -14.629 |
| 3.89557489045126 | -0.685 | -3.396 | -14.699 |
| 3.901858075758439 | -0.689 | -3.413 | -14.768 |
| 3.908141261065619 | -0.694 | -3.431 | -14.837 |
| 3.914424446372799 | -0.698 | -3.449 | -14.906 |
| 3.920707631679978 | -0.703 | -3.466 | -14.975 |
| 3.926990816987158 | -0.707 | -3.484 | -15.044 |
| 3.933274002294337 | -0.712 | -3.501 | -15.112 |
| 3.939557187601517 | -0.716 | -3.519 | -15.18 |
| 3.945840372908697 | -0.72 | -3.536 | -15.248 |
| 3.952123558215876 | -0.725 | -3.553 | -15.316 |
| 3.958406743523056 | -0.729 | -3.57 | -15.384 |
| 3.964689928830236 | -0.733 | -3.587 | -15.451 |
| 3.970973114137415 | -0.738 | -3.604 | -15.518 |
| 3.977256299444595 | -0.742 | -3.621 | -15.585 |
| 3.983539484751775 | -0.746 | -3.637 | -15.651 |
| 3.989822670058954 | -0.75 | -3.654 | -15.718 |
| 3.996105855366134 | -0.754 | -3.671 | -15.784 |
| 4.002389040673314 | -0.758 | -3.687 | -15.849 |
| 4.008672225980493 | -0.762 | -3.703 | -15.915 |
| 4.014955411287672 | -0.766 | -3.72 | -15.98 |
| 4.021238596594851 | -0.771 | -3.736 | -16.045 |
| 4.02752178190203 | -0.775 | -3.752 | -16.11 |
| 4.03380496720921 | -0.778 | -3.768 | -16.174 |
| 4.040088152516389 | -0.782 | -3.784 | -16.238 |
| 4.046371337823567 | -0.786 | -3.799 | -16.302 |
| 4.052654523130747 | -0.79 | -3.815 | -16.365 |
| 4.058937708437926 | -0.794 | -3.831 | -16.428 |
| 4.065220893745105 | -0.798 | -3.846 | -16.491 |
| 4.071504079052285 | -0.802 | -3.861 | -16.553 |
| 4.077787264359464 | -0.805 | -3.877 | -16.615 |
| 4.084070449666643 | -0.809 | -3.892 | -16.677 |
| 4.090353634973822 | -0.813 | -3.907 | -16.739 |
| 4.096636820281001 | -0.816 | -3.922 | -16.8 |
| 4.102920005588181 | -0.82 | -3.937 | -16.86 |
| 4.10920319089536 | -0.824 | -3.951 | -16.921 |
| 4.115486376202539 | -0.827 | -3.966 | -16.981 |
| 4.121769561509718 | -0.831 | -3.98 | -17.04 |
| 4.128052746816897 | -0.834 | -3.995 | -17.1 |
| 4.134335932124077 | -0.838 | -4.009 | -17.159 |
| 4.140619117431256 | -0.841 | -4.023 | -17.217 |
| 4.146902302738435 | -0.844 | -4.037 | -17.275 |
| 4.153185488045614 | -0.848 | -4.051 | -17.333 |
| 4.159468673352793 | -0.851 | -4.065 | -17.39 |
| 4.165751858659973 | -0.854 | -4.079 | -17.447 |
| 4.172035043967152 | -0.858 | -4.092 | -17.503 |
| 4.178318229274331 | -0.861 | -4.105 | -17.56 |
| 4.18460141458151 | -0.864 | -4.119 | -17.615 |
| 4.190884599888689 | -0.867 | -4.132 | -17.67 |
| 4.197167785195868 | -0.87 | -4.145 | -17.725 |
| 4.203450970503048 | -0.873 | -4.158 | -17.779 |
| 4.209734155810227 | -0.876 | -4.171 | -17.833 |
| 4.216017341117406 | -0.879 | -4.183 | -17.887 |
| 4.222300526424585 | -0.882 | -4.196 | -17.94 |
| 4.228583711731764 | -0.885 | -4.208 | -17.992 |
| 4.234866897038944 | -0.888 | -4.221 | -18.044 |
| 4.241150082346122 | -0.891 | -4.233 | -18.096 |
| 4.247433267653302 | -0.894 | -4.245 | -18.147 |
| 4.253716452960481 | -0.897 | -4.257 | -18.197 |
| 4.25999963826766 | -0.899 | -4.269 | -18.247 |
| 4.26628282357484 | -0.902 | -4.28 | -18.297 |
| 4.272566008882019 | -0.905 | -4.292 | -18.346 |
| 4.278849194189198 | -0.907 | -4.303 | -18.395 |
| 4.285132379496377 | -0.91 | -4.314 | -18.443 |
| 4.291415564803557 | -0.913 | -4.325 | -18.49 |
| 4.297698750110735 | -0.915 | -4.336 | -18.537 |
| 4.303981935417915 | -0.918 | -4.347 | -18.584 |
| 4.310265120725094 | -0.92 | -4.358 | -18.63 |
| 4.316548306032273 | -0.923 | -4.368 | -18.675 |
| 4.322831491339452 | -0.925 | -4.379 | -18.72 |
| 4.329114676646632 | -0.927 | -4.389 | -18.764 |
| 4.335397861953811 | -0.93 | -4.399 | -18.808 |
| 4.34168104726099 | -0.932 | -4.409 | -18.851 |
| 4.347964232568169 | -0.934 | -4.419 | -18.894 |
| 4.354247417875348 | -0.937 | -4.429 | -18.936 |
| 4.360530603182528 | -0.939 | -4.438 | -18.977 |
| 4.366813788489707 | -0.941 | -4.447 | -19.018 |
| 4.373096973796886 | -0.943 | -4.457 | -19.059 |
| 4.379380159104065 | -0.945 | -4.466 | -19.098 |
| 4.385663344411244 | -0.947 | -4.475 | -19.137 |
| 4.391946529718424 | -0.949 | -4.483 | -19.176 |
| 4.398229715025602 | -0.951 | -4.492 | -19.214 |
| 4.404512900332782 | -0.953 | -4.5 | -19.251 |
| 4.41079608563996 | -0.955 | -4.509 | -19.288 |
| 4.41707927094714 | -0.957 | -4.517 | -19.324 |
| 4.42336245625432 | -0.959 | -4.525 | -19.359 |
| 4.429645641561499 | -0.96 | -4.533 | -19.394 |
| 4.435928826868678 | -0.962 | -4.54 | -19.428 |
| 4.442212012175857 | -0.964 | -4.548 | -19.461 |
| 4.448495197483036 | -0.965 | -4.555 | -19.494 |
| 4.454778382790215 | -0.967 | -4.563 | -19.526 |
| 4.461061568097395 | -0.969 | -4.57 | -19.558 |
| 4.467344753404574 | -0.97 | -4.576 | -19.588 |
| 4.473627938711753 | -0.972 | -4.583 | -19.618 |
| 4.479911124018932 | -0.973 | -4.59 | -19.648 |
| 4.486194309326112 | -0.975 | -4.596 | -19.676 |
| 4.49247749463329 | -0.976 | -4.602 | -19.704 |
| 4.49876067994047 | -0.977 | -4.609 | -19.732 |
| 4.50504386524765 | -0.979 | -4.614 | -19.758 |
| 4.511327050554828 | -0.98 | -4.62 | -19.784 |
| 4.517610235862008 | -0.981 | -4.626 | -19.809 |
| 4.523893421169186 | -0.982 | -4.631 | -19.834 |
| 4.530176606476366 | -0.983 | -4.636 | -19.858 |
| 4.536459791783545 | -0.985 | -4.641 | -19.881 |
| 4.542742977090724 | -0.986 | -4.646 | -19.903 |
| 4.549026162397904 | -0.987 | -4.651 | -19.924 |
| 4.555309347705083 | -0.988 | -4.656 | -19.945 |
| 4.561592533012262 | -0.989 | -4.66 | -19.965 |
| 4.567875718319441 | -0.99 | -4.664 | -19.984 |
| 4.57415890362662 | -0.99 | -4.668 | -20.003 |
| 4.5804420889338 | -0.991 | -4.672 | -20.021 |
| 4.586725274240979 | -0.992 | -4.676 | -20.038 |
| 4.593008459548158 | -0.993 | -4.679 | -20.054 |
| 4.599291644855337 | -0.994 | -4.683 | -20.069 |
| 4.605574830162516 | -0.994 | -4.686 | -20.084 |
| 4.611858015469695 | -0.995 | -4.689 | -20.098 |
| 4.618141200776875 | -0.996 | -4.692 | -20.111 |
| 4.624424386084054 | -0.996 | -4.694 | -20.123 |
| 4.630707571391233 | -0.997 | -4.697 | -20.134 |
| 4.636990756698412 | -0.997 | -4.699 | -20.145 |
| 4.643273942005591 | -0.998 | -4.701 | -20.155 |
| 4.649557127312771 | -0.998 | -4.703 | -20.164 |
| 4.65584031261995 | -0.998 | -4.705 | -20.172 |
| 4.66212349792713 | -0.999 | -4.706 | -20.179 |
| 4.668406683234308 | -0.999 | -4.708 | -20.185 |
| 4.674689868541487 | -0.999 | -4.709 | -20.191 |
| 4.680973053848666 | -1 | -4.71 | -20.196 |
| 4.687256239155846 | -1 | -4.711 | -20.2 |
| 4.693539424463024 | -1 | -4.712 | -20.203 |
| 4.699822609770204 | -1 | -4.712 | -20.205 |
| 4.706105795077383 | -1 | -4.712 | -20.206 |
| 4.712388980384562 | -1 | -4.712 | -20.207 |
| 4.718672165691741 | -1 | -4.712 | -20.206 |
| 4.724955350998921 | -1 | -4.712 | -20.205 |
| 4.7312385363061 | -1 | -4.712 | -20.203 |
| 4.73752172161328 | -1 | -4.711 | -20.2 |
| 4.743804906920459 | -1 | -4.71 | -20.196 |
| 4.750088092227637 | -0.999 | -4.709 | -20.191 |
| 4.756371277534817 | -0.999 | -4.708 | -20.185 |
| 4.762654462841996 | -0.999 | -4.706 | -20.178 |
| 4.768937648149175 | -0.998 | -4.705 | -20.171 |
| 4.775220833456354 | -0.998 | -4.703 | -20.162 |
| 4.781504018763534 | -0.998 | -4.701 | -20.153 |
| 4.787787204070713 | -0.997 | -4.699 | -20.142 |
| 4.794070389377892 | -0.997 | -4.696 | -20.131 |
| 4.800353574685071 | -0.996 | -4.694 | -20.119 |
| 4.806636759992251 | -0.996 | -4.691 | -20.105 |
| 4.81291994529943 | -0.995 | -4.688 | -20.091 |
| 4.819203130606608 | -0.994 | -4.685 | -20.076 |
| 4.825486315913788 | -0.994 | -4.682 | -20.06 |
| 4.831769501220967 | -0.993 | -4.678 | -20.043 |
| 4.838052686528146 | -0.992 | -4.675 | -20.025 |
| 4.844335871835326 | -0.991 | -4.671 | -20.006 |
| 4.850619057142505 | -0.99 | -4.667 | -19.986 |
| 4.856902242449684 | -0.99 | -4.662 | -19.966 |
| 4.863185427756863 | -0.989 | -4.658 | -19.944 |
| 4.869468613064042 | -0.988 | -4.653 | -19.921 |
| 4.875751798371221 | -0.987 | -4.648 | -19.897 |
| 4.882034983678401 | -0.986 | -4.643 | -19.872 |
| 4.88831816898558 | -0.985 | -4.638 | -19.847 |
| 4.894601354292759 | -0.983 | -4.632 | -19.82 |
| 4.900884539599939 | -0.982 | -4.627 | -19.792 |
| 4.907167724907117 | -0.981 | -4.621 | -19.763 |
| 4.913450910214297 | -0.98 | -4.615 | -19.733 |
| 4.919734095521476 | -0.979 | -4.608 | -19.703 |
| 4.926017280828655 | -0.977 | -4.602 | -19.671 |
| 4.932300466135834 | -0.976 | -4.595 | -19.638 |
| 4.938583651443014 | -0.975 | -4.589 | -19.604 |
| 4.944866836750193 | -0.973 | -4.581 | -19.569 |
| 4.951150022057372 | -0.972 | -4.574 | -19.533 |
| 4.957433207364551 | -0.97 | -4.567 | -19.496 |
| 4.96371639267173 | -0.969 | -4.559 | -19.458 |
| 4.96999957797891 | -0.967 | -4.551 | -19.419 |
| 4.976282763286088 | -0.965 | -4.543 | -19.379 |
| 4.982565948593268 | -0.964 | -4.535 | -19.338 |
| 4.988849133900447 | -0.962 | -4.526 | -19.296 |
| 4.995132319207626 | -0.96 | -4.518 | -19.253 |
| 5.001415504514805 | -0.959 | -4.509 | -19.209 |
| 5.007698689821984 | -0.957 | -4.5 | -19.163 |
| 5.013981875129164 | -0.955 | -4.491 | -19.117 |
| 5.020265060436343 | -0.953 | -4.481 | -19.069 |
| 5.026548245743522 | -0.951 | -4.472 | -19.021 |
| 5.032831431050702 | -0.949 | -4.462 | -18.971 |
| 5.039114616357881 | -0.947 | -4.452 | -18.921 |
| 5.04539780166506 | -0.945 | -4.441 | -18.869 |
| 5.05168098697224 | -0.943 | -4.431 | -18.816 |
| 5.057964172279418 | -0.941 | -4.42 | -18.762 |
| 5.064247357586598 | -0.939 | -4.409 | -18.707 |
| 5.070530542893777 | -0.937 | -4.398 | -18.651 |
| 5.076813728200956 | -0.934 | -4.387 | -18.594 |
| 5.083096913508135 | -0.932 | -4.376 | -18.536 |
| 5.089380098815314 | -0.93 | -4.364 | -18.476 |
| 5.095663284122493 | -0.927 | -4.352 | -18.416 |
| 5.101946469429673 | -0.925 | -4.34 | -18.354 |
| 5.108229654736852 | -0.923 | -4.328 | -18.292 |
| 5.114512840044031 | -0.92 | -4.315 | -18.228 |
| 5.12079602535121 | -0.918 | -4.302 | -18.163 |
| 5.12707921065839 | -0.915 | -4.29 | -18.097 |
| 5.133362395965568 | -0.913 | -4.277 | -18.03 |
| 5.139645581272747 | -0.91 | -4.263 | -17.962 |
| 5.145928766579927 | -0.907 | -4.25 | -17.892 |
| 5.152211951887106 | -0.905 | -4.236 | -17.822 |
| 5.158495137194286 | -0.902 | -4.222 | -17.75 |
| 5.164778322501465 | -0.899 | -4.208 | -17.678 |
| 5.171061507808644 | -0.897 | -4.194 | -17.604 |
| 5.177344693115823 | -0.894 | -4.179 | -17.529 |
| 5.183627878423002 | -0.891 | -4.165 | -17.453 |
| 5.189911063730181 | -0.888 | -4.15 | -17.375 |
| 5.196194249037361 | -0.885 | -4.135 | -17.297 |
| 5.20247743434454 | -0.882 | -4.119 | -17.218 |
| 5.20876061965172 | -0.879 | -4.104 | -17.137 |
| 5.215043804958898 | -0.876 | -4.088 | -17.055 |
| 5.221326990266077 | -0.873 | -4.072 | -16.972 |
| 5.227610175573257 | -0.87 | -4.056 | -16.888 |
| 5.233893360880435 | -0.867 | -4.04 | -16.803 |
| 5.240176546187615 | -0.864 | -4.023 | -16.717 |
| 5.246459731494794 | -0.861 | -4.007 | -16.629 |
| 5.252742916801973 | -0.858 | -3.99 | -16.541 |
| 5.259026102109152 | -0.854 | -3.973 | -16.451 |
| 5.265309287416332 | -0.851 | -3.956 | -16.36 |
| 5.27159247272351 | -0.848 | -3.938 | -16.268 |
| 5.27787565803069 | -0.844 | -3.92 | -16.175 |
| 5.284158843337869 | -0.841 | -3.903 | -16.081 |
| 5.290442028645049 | -0.838 | -3.884 | -15.985 |
| 5.296725213952227 | -0.834 | -3.866 | -15.888 |
| 5.303008399259407 | -0.831 | -3.848 | -15.791 |
| 5.309291584566586 | -0.827 | -3.829 | -15.692 |
| 5.315574769873765 | -0.824 | -3.81 | -15.591 |
| 5.321857955180945 | -0.82 | -3.791 | -15.49 |
| 5.328141140488124 | -0.816 | -3.772 | -15.388 |
| 5.334424325795303 | -0.813 | -3.753 | -15.284 |
| 5.340707511102482 | -0.809 | -3.733 | -15.179 |
| 5.346990696409661 | -0.805 | -3.713 | -15.073 |
| 5.35327388171684 | -0.802 | -3.693 | -14.966 |
| 5.35955706702402 | -0.798 | -3.673 | -14.858 |
| 5.365840252331199 | -0.794 | -3.652 | -14.749 |
| 5.372123437638378 | -0.79 | -3.632 | -14.638 |
| 5.378406622945557 | -0.786 | -3.611 | -14.526 |
| 5.384689808252737 | -0.782 | -3.59 | -14.414 |
| 5.390972993559916 | -0.778 | -3.569 | -14.299 |
| 5.397256178867095 | -0.775 | -3.548 | -14.184 |
| 5.403539364174274 | -0.771 | -3.526 | -14.068 |
| 5.409822549481453 | -0.766 | -3.504 | -13.95 |
| 5.416105734788632 | -0.762 | -3.482 | -13.832 |
| 5.422388920095812 | -0.758 | -3.46 | -13.712 |
| 5.42867210540299 | -0.754 | -3.438 | -13.591 |
| 5.43495529071017 | -0.75 | -3.416 | -13.469 |
| 5.44123847601735 | -0.746 | -3.393 | -13.345 |
| 5.447521661324528 | -0.742 | -3.37 | -13.221 |
| 5.453804846631708 | -0.738 | -3.347 | -13.095 |
| 5.460088031938887 | -0.733 | -3.324 | -12.968 |
| 5.466371217246066 | -0.729 | -3.3 | -12.841 |
| 5.472654402553245 | -0.725 | -3.277 | -12.711 |
| 5.478937587860424 | -0.72 | -3.253 | -12.581 |
| 5.485220773167603 | -0.716 | -3.229 | -12.45 |
| 5.491503958474783 | -0.712 | -3.205 | -12.317 |
| 5.497787143781962 | -0.707 | -3.18 | -12.184 |
| 5.504070329089141 | -0.703 | -3.156 | -12.049 |
| 5.51035351439632 | -0.698 | -3.131 | -11.913 |
| 5.5166366997035 | -0.694 | -3.106 | -11.775 |
| 5.522919885010679 | -0.689 | -3.081 | -11.637 |
| 5.529203070317858 | -0.685 | -3.056 | -11.498 |
| 5.535486255625037 | -0.68 | -3.031 | -11.357 |
| 5.541769440932216 | -0.675 | -3.005 | -11.215 |
| 5.548052626239396 | -0.671 | -2.979 | -11.072 |
| 5.554335811546575 | -0.666 | -2.953 | -10.928 |
| 5.560618996853754 | -0.661 | -2.927 | -10.783 |
| 5.566902182160933 | -0.657 | -2.901 | -10.637 |
| 5.573185367468112 | -0.652 | -2.874 | -10.49 |
| 5.579468552775292 | -0.647 | -2.848 | -10.341 |
| 5.585751738082471 | -0.642 | -2.821 | -10.191 |
| 5.59203492338965 | -0.637 | -2.794 | -10.04 |
| 5.59831810869683 | -0.633 | -2.767 | -9.889 |
| 5.604601294004008 | -0.628 | -2.739 | -9.735 |
| 5.610884479311188 | -0.623 | -2.712 | -9.581 |
| 5.617167664618367 | -0.618 | -2.684 | -9.426 |
| 5.623450849925546 | -0.613 | -2.656 | -9.269 |
| 5.629734035232725 | -0.608 | -2.628 | -9.112 |
| 5.636017220539904 | -0.603 | -2.6 | -8.953 |
| 5.642300405847083 | -0.598 | -2.572 | -8.793 |
| 5.648583591154263 | -0.593 | -2.543 | -8.633 |
| 5.654866776461442 | -0.588 | -2.515 | -8.471 |
| 5.661149961768621 | -0.583 | -2.486 | -8.307 |
| 5.6674331470758 | -0.578 | -2.457 | -8.143 |
| 5.673716332382979 | -0.572 | -2.428 | -7.978 |
| 5.679999517690159 | -0.567 | -2.399 | -7.812 |
| 5.686282702997337 | -0.562 | -2.369 | -7.644 |
| 5.692565888304517 | -0.557 | -2.339 | -7.476 |
| 5.698849073611696 | -0.552 | -2.31 | -7.306 |
| 5.705132258918875 | -0.546 | -2.28 | -7.135 |
| 5.711415444226055 | -0.541 | -2.25 | -6.963 |
| 5.717698629533234 | -0.536 | -2.219 | -6.79 |
| 5.723981814840413 | -0.531 | -2.189 | -6.616 |
| 5.730265000147592 | -0.525 | -2.158 | -6.441 |
| 5.73654818545477 | -0.52 | -2.128 | -6.265 |
| 5.742831370761951 | -0.514 | -2.097 | -6.088 |
| 5.74911455606913 | -0.509 | -2.066 | -5.91 |
| 5.75539774137631 | -0.504 | -2.035 | -5.731 |
| 5.761680926683488 | -0.498 | -2.003 | -5.55 |
| 5.767964111990667 | -0.493 | -1.972 | -5.369 |
| 5.774247297297846 | -0.487 | -1.94 | -5.186 |
| 5.780530482605025 | -0.482 | -1.908 | -5.003 |
| 5.786813667912205 | -0.476 | -1.877 | -4.819 |
| 5.793096853219384 | -0.471 | -1.845 | -4.633 |
| 5.799380038526563 | -0.465 | -1.812 | -4.446 |
| 5.805663223833742 | -0.46 | -1.78 | -4.259 |
| 5.811946409140922 | -0.454 | -1.748 | -4.07 |
| 5.8182295944481 | -0.448 | -1.715 | -3.881 |
| 5.82451277975528 | -0.443 | -1.682 | -3.69 |
| 5.830795965062459 | -0.437 | -1.649 | -3.498 |
| 5.837079150369638 | -0.431 | -1.616 | -3.306 |
| 5.843362335676817 | -0.426 | -1.583 | -3.112 |
| 5.849645520983997 | -0.42 | -1.55 | -2.918 |
| 5.855928706291176 | -0.414 | -1.516 | -2.722 |
| 5.862211891598355 | -0.409 | -1.483 | -2.525 |
| 5.868495076905535 | -0.403 | -1.449 | -2.328 |
| 5.874778262212714 | -0.397 | -1.415 | -2.129 |
| 5.881061447519893 | -0.391 | -1.381 | -1.93 |
| 5.887344632827072 | -0.386 | -1.347 | -1.729 |
| 5.893627818134251 | -0.38 | -1.313 | -1.528 |
| 5.899911003441431 | -0.374 | -1.279 | -1.326 |
| 5.90619418874861 | -0.368 | -1.244 | -1.122 |
| 5.912477374055789 | -0.362 | -1.21 | -0.918 |
| 5.918760559362968 | -0.356 | -1.175 | -0.713 |
| 5.925043744670147 | -0.351 | -1.14 | -0.507 |
| 5.931326929977326 | -0.345 | -1.105 | -0.3 |
| 5.937610115284505 | -0.339 | -1.07 | -0.092 |
| 5.943893300591684 | -0.333 | -1.035 | 0.117 |
| 5.950176485898864 | -0.327 | -1 | 0.327 |
| 5.956459671206043 | -0.321 | -0.965 | 0.538 |
| 5.962742856513223 | -0.315 | -0.929 | 0.749 |
| 5.969026041820402 | -0.309 | -0.893 | 0.962 |
| 5.975309227127581 | -0.303 | -0.858 | 1.175 |
| 5.98159241243476 | -0.297 | -0.822 | 1.389 |
| 5.987875597741939 | -0.291 | -0.786 | 1.604 |
| 5.994158783049118 | -0.285 | -0.75 | 1.82 |
| 6.000441968356298 | -0.279 | -0.714 | 2.037 |
| 6.006725153663476 | -0.273 | -0.678 | 2.255 |
| 6.013008338970656 | -0.267 | -0.641 | 2.473 |
| 6.019291524277835 | -0.261 | -0.605 | 2.693 |
| 6.025574709585015 | -0.255 | -0.568 | 2.913 |
| 6.031857894892193 | -0.249 | -0.531 | 3.134 |
| 6.038141080199372 | -0.243 | -0.495 | 3.356 |
| 6.044424265506552 | -0.236 | -0.458 | 3.578 |
| 6.050707450813731 | -0.23 | -0.421 | 3.802 |
| 6.05699063612091 | -0.224 | -0.384 | 4.026 |
| 6.06327382142809 | -0.218 | -0.347 | 4.251 |
| 6.069557006735269 | -0.212 | -0.31 | 4.477 |
| 6.075840192042448 | -0.206 | -0.272 | 4.704 |
| 6.082123377349627 | -0.2 | -0.235 | 4.931 |
| 6.088406562656806 | -0.194 | -0.197 | 5.159 |
| 6.094689747963986 | -0.187 | -0.16 | 5.388 |
| 6.100972933271164 | -0.181 | -0.122 | 5.618 |
| 6.107256118578344 | -0.175 | -0.084 | 5.848 |
| 6.113539303885523 | -0.169 | -0.047 | 6.079 |
| 6.119822489192702 | -0.163 | -0.009 | 6.311 |
| 6.126105674499882 | -0.156 | 0.029 | 6.543 |
| 6.132388859807061 | -0.15 | 0.067 | 6.777 |
| 6.13867204511424 | -0.144 | 0.106 | 7.011 |
| 6.144955230421419 | -0.138 | 0.144 | 7.245 |
| 6.151238415728598 | -0.132 | 0.182 | 7.481 |
| 6.157521601035778 | -0.125 | 0.22 | 7.717 |
| 6.163804786342957 | -0.119 | 0.259 | 7.953 |
| 6.170087971650136 | -0.113 | 0.297 | 8.191 |
| 6.176371156957315 | -0.107 | 0.336 | 8.429 |
| 6.182654342264494 | -0.1 | 0.374 | 8.667 |
| 6.188937527571674 | -0.094 | 0.413 | 8.907 |
| 6.195220712878853 | -0.088 | 0.452 | 9.146 |
| 6.201503898186032 | -0.082 | 0.491 | 9.387 |
| 6.207787083493211 | -0.075 | 0.53 | 9.628 |
| 6.21407026880039 | -0.069 | 0.568 | 9.87 |
| 6.22035345410757 | -0.063 | 0.607 | 10.112 |
| 6.226636639414749 | -0.057 | 0.646 | 10.355 |
| 6.232919824721928 | -0.05 | 0.686 | 10.599 |
| 6.239203010029107 | -0.044 | 0.725 | 10.843 |
| 6.245486195336286 | -0.038 | 0.764 | 11.087 |
| 6.251769380643465 | -0.031 | 0.803 | 11.333 |
| 6.258052565950644 | -0.025 | 0.842 | 11.578 |
| 6.264335751257824 | -0.019 | 0.882 | 11.824 |
| 6.270618936565003 | -0.013 | 0.921 | 12.071 |
| 6.276902121872182 | -0.006 | 0.961 | 12.319 |
| 6.283185307179361 | 0 | 1 | 12.566 |